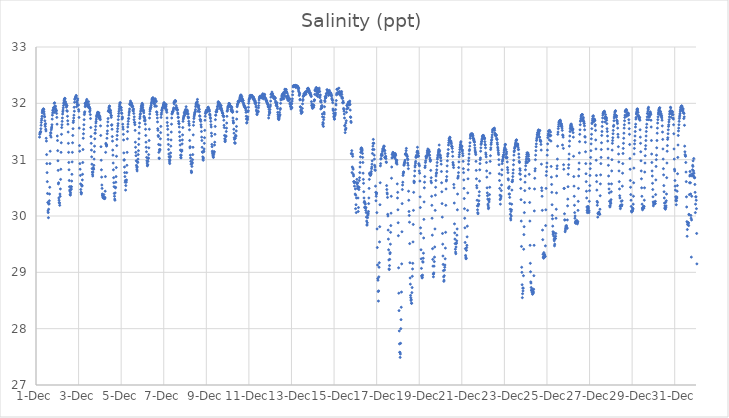
| Category | Salinity (ppt) |
|---|---|
| 44896.166666666664 | 31.4 |
| 44896.177083333336 | 31.45 |
| 44896.1875 | 31.47 |
| 44896.197916666664 | 31.48 |
| 44896.208333333336 | 31.49 |
| 44896.21875 | 31.5 |
| 44896.229166666664 | 31.55 |
| 44896.239583333336 | 31.61 |
| 44896.25 | 31.66 |
| 44896.260416666664 | 31.7 |
| 44896.270833333336 | 31.73 |
| 44896.28125 | 31.77 |
| 44896.291666666664 | 31.83 |
| 44896.302083333336 | 31.86 |
| 44896.3125 | 31.87 |
| 44896.322916666664 | 31.89 |
| 44896.333333333336 | 31.89 |
| 44896.34375 | 31.9 |
| 44896.354166666664 | 31.9 |
| 44896.364583333336 | 31.89 |
| 44896.375 | 31.85 |
| 44896.385416666664 | 31.81 |
| 44896.395833333336 | 31.77 |
| 44896.40625 | 31.76 |
| 44896.416666666664 | 31.69 |
| 44896.427083333336 | 31.62 |
| 44896.4375 | 31.59 |
| 44896.447916666664 | 31.64 |
| 44896.458333333336 | 31.54 |
| 44896.46875 | 31.51 |
| 44896.479166666664 | 31.38 |
| 44896.489583333336 | 31.33 |
| 44896.5 | 31.09 |
| 44896.510416666664 | 30.93 |
| 44896.520833333336 | 30.77 |
| 44896.53125 | 30.61 |
| 44896.541666666664 | 30.4 |
| 44896.552083333336 | 30.24 |
| 44896.5625 | 30.09 |
| 44896.572916666664 | 30.06 |
| 44896.583333333336 | 29.97 |
| 44896.59375 | 30.12 |
| 44896.604166666664 | 30.21 |
| 44896.614583333336 | 30.22 |
| 44896.625 | 30.27 |
| 44896.635416666664 | 30.39 |
| 44896.645833333336 | 30.51 |
| 44896.65625 | 30.93 |
| 44896.666666666664 | 31.15 |
| 44896.677083333336 | 31.43 |
| 44896.6875 | 31.48 |
| 44896.697916666664 | 31.47 |
| 44896.708333333336 | 31.4 |
| 44896.71875 | 31.53 |
| 44896.729166666664 | 31.56 |
| 44896.739583333336 | 31.58 |
| 44896.75 | 31.62 |
| 44896.760416666664 | 31.72 |
| 44896.770833333336 | 31.79 |
| 44896.78125 | 31.83 |
| 44896.791666666664 | 31.87 |
| 44896.802083333336 | 31.88 |
| 44896.8125 | 31.89 |
| 44896.822916666664 | 31.92 |
| 44896.833333333336 | 31.92 |
| 44896.84375 | 31.93 |
| 44896.854166666664 | 32 |
| 44896.864583333336 | 31.84 |
| 44896.875 | 32.01 |
| 44896.885416666664 | 31.95 |
| 44896.895833333336 | 31.93 |
| 44896.90625 | 31.89 |
| 44896.916666666664 | 31.95 |
| 44896.927083333336 | 31.9 |
| 44896.9375 | 31.86 |
| 44896.947916666664 | 31.88 |
| 44896.958333333336 | 31.87 |
| 44896.96875 | 31.82 |
| 44896.979166666664 | 31.75 |
| 44896.989583333336 | 31.63 |
| 44897.0 | 31.42 |
| 44897.010416666664 | 31.34 |
| 44897.020833333336 | 31.16 |
| 44897.03125 | 30.98 |
| 44897.041666666664 | 30.81 |
| 44897.052083333336 | 30.57 |
| 44897.0625 | 30.59 |
| 44897.072916666664 | 30.32 |
| 44897.083333333336 | 30.28 |
| 44897.09375 | 30.24 |
| 44897.104166666664 | 30.23 |
| 44897.114583333336 | 30.19 |
| 44897.125 | 30.39 |
| 44897.135416666664 | 30.35 |
| 44897.145833333336 | 30.48 |
| 44897.15625 | 30.65 |
| 44897.166666666664 | 30.83 |
| 44897.177083333336 | 31.13 |
| 44897.1875 | 31.3 |
| 44897.197916666664 | 31.45 |
| 44897.208333333336 | 31.57 |
| 44897.21875 | 31.62 |
| 44897.229166666664 | 31.68 |
| 44897.239583333336 | 31.74 |
| 44897.25 | 31.81 |
| 44897.260416666664 | 31.85 |
| 44897.270833333336 | 31.88 |
| 44897.28125 | 31.92 |
| 44897.291666666664 | 31.96 |
| 44897.302083333336 | 32 |
| 44897.3125 | 32.02 |
| 44897.322916666664 | 32.05 |
| 44897.333333333336 | 32.07 |
| 44897.34375 | 32.08 |
| 44897.354166666664 | 32.09 |
| 44897.364583333336 | 32.08 |
| 44897.375 | 31.99 |
| 44897.385416666664 | 32.03 |
| 44897.395833333336 | 32 |
| 44897.40625 | 31.98 |
| 44897.416666666664 | 31.99 |
| 44897.427083333336 | 31.93 |
| 44897.4375 | 31.95 |
| 44897.447916666664 | 31.87 |
| 44897.458333333336 | 31.96 |
| 44897.46875 | 31.86 |
| 44897.479166666664 | 31.77 |
| 44897.489583333336 | 31.69 |
| 44897.5 | 31.63 |
| 44897.510416666664 | 31.49 |
| 44897.520833333336 | 31.29 |
| 44897.53125 | 31.13 |
| 44897.541666666664 | 30.95 |
| 44897.552083333336 | 30.82 |
| 44897.5625 | 30.63 |
| 44897.572916666664 | 30.52 |
| 44897.583333333336 | 30.46 |
| 44897.59375 | 30.44 |
| 44897.604166666664 | 30.38 |
| 44897.614583333336 | 30.37 |
| 44897.625 | 30.41 |
| 44897.635416666664 | 30.52 |
| 44897.645833333336 | 30.47 |
| 44897.65625 | 30.48 |
| 44897.666666666664 | 30.52 |
| 44897.677083333336 | 30.62 |
| 44897.6875 | 30.74 |
| 44897.697916666664 | 30.96 |
| 44897.708333333336 | 31.13 |
| 44897.71875 | 31.3 |
| 44897.729166666664 | 31.43 |
| 44897.739583333336 | 31.55 |
| 44897.75 | 31.66 |
| 44897.760416666664 | 31.69 |
| 44897.770833333336 | 31.74 |
| 44897.78125 | 31.79 |
| 44897.791666666664 | 31.93 |
| 44897.802083333336 | 31.86 |
| 44897.8125 | 32.02 |
| 44897.822916666664 | 32.07 |
| 44897.833333333336 | 32.08 |
| 44897.84375 | 32.09 |
| 44897.854166666664 | 32.11 |
| 44897.864583333336 | 32.11 |
| 44897.875 | 32.11 |
| 44897.885416666664 | 32.14 |
| 44897.895833333336 | 32.13 |
| 44897.90625 | 31.94 |
| 44897.916666666664 | 32.02 |
| 44897.927083333336 | 32.02 |
| 44897.9375 | 31.98 |
| 44897.947916666664 | 32.05 |
| 44897.958333333336 | 32.08 |
| 44897.96875 | 31.97 |
| 44897.979166666664 | 31.97 |
| 44897.989583333336 | 31.97 |
| 44898.0 | 31.89 |
| 44898.010416666664 | 31.86 |
| 44898.020833333336 | 31.75 |
| 44898.03125 | 31.56 |
| 44898.041666666664 | 31.25 |
| 44898.052083333336 | 31.15 |
| 44898.0625 | 30.93 |
| 44898.072916666664 | 30.83 |
| 44898.083333333336 | 30.72 |
| 44898.09375 | 30.57 |
| 44898.104166666664 | 30.47 |
| 44898.114583333336 | 30.42 |
| 44898.125 | 30.39 |
| 44898.135416666664 | 30.41 |
| 44898.145833333336 | 30.55 |
| 44898.15625 | 30.53 |
| 44898.166666666664 | 30.54 |
| 44898.177083333336 | 30.64 |
| 44898.1875 | 30.74 |
| 44898.197916666664 | 30.95 |
| 44898.208333333336 | 31.18 |
| 44898.21875 | 31.38 |
| 44898.229166666664 | 31.46 |
| 44898.239583333336 | 31.54 |
| 44898.25 | 31.62 |
| 44898.260416666664 | 31.71 |
| 44898.270833333336 | 31.8 |
| 44898.28125 | 31.83 |
| 44898.291666666664 | 31.85 |
| 44898.302083333336 | 32 |
| 44898.3125 | 31.94 |
| 44898.322916666664 | 31.96 |
| 44898.333333333336 | 31.98 |
| 44898.34375 | 32 |
| 44898.354166666664 | 32.02 |
| 44898.364583333336 | 32.04 |
| 44898.375 | 32.01 |
| 44898.385416666664 | 32.07 |
| 44898.395833333336 | 32.03 |
| 44898.40625 | 32.01 |
| 44898.416666666664 | 31.95 |
| 44898.427083333336 | 31.97 |
| 44898.4375 | 31.94 |
| 44898.447916666664 | 31.96 |
| 44898.458333333336 | 31.97 |
| 44898.46875 | 32.03 |
| 44898.479166666664 | 31.98 |
| 44898.489583333336 | 31.92 |
| 44898.5 | 31.94 |
| 44898.510416666664 | 31.92 |
| 44898.520833333336 | 31.85 |
| 44898.53125 | 31.91 |
| 44898.541666666664 | 31.88 |
| 44898.552083333336 | 31.8 |
| 44898.5625 | 31.73 |
| 44898.572916666664 | 31.57 |
| 44898.583333333336 | 31.41 |
| 44898.59375 | 31.29 |
| 44898.604166666664 | 31.17 |
| 44898.614583333336 | 31.05 |
| 44898.625 | 30.92 |
| 44898.635416666664 | 30.84 |
| 44898.645833333336 | 30.78 |
| 44898.65625 | 30.74 |
| 44898.666666666664 | 30.71 |
| 44898.677083333336 | 30.78 |
| 44898.6875 | 30.86 |
| 44898.697916666664 | 30.84 |
| 44898.708333333336 | 30.83 |
| 44898.71875 | 30.9 |
| 44898.729166666664 | 31.01 |
| 44898.739583333336 | 31.14 |
| 44898.75 | 31.24 |
| 44898.760416666664 | 31.37 |
| 44898.770833333336 | 31.47 |
| 44898.78125 | 31.47 |
| 44898.791666666664 | 31.53 |
| 44898.802083333336 | 31.59 |
| 44898.8125 | 31.65 |
| 44898.822916666664 | 31.68 |
| 44898.833333333336 | 31.72 |
| 44898.84375 | 31.76 |
| 44898.854166666664 | 31.78 |
| 44898.864583333336 | 31.79 |
| 44898.875 | 31.8 |
| 44898.885416666664 | 31.82 |
| 44898.895833333336 | 31.84 |
| 44898.90625 | 31.84 |
| 44898.916666666664 | 31.84 |
| 44898.927083333336 | 31.81 |
| 44898.9375 | 31.79 |
| 44898.947916666664 | 31.75 |
| 44898.958333333336 | 31.83 |
| 44898.96875 | 31.79 |
| 44898.979166666664 | 31.73 |
| 44898.989583333336 | 31.73 |
| 44899.0 | 31.77 |
| 44899.010416666664 | 31.74 |
| 44899.020833333336 | 31.71 |
| 44899.03125 | 31.6 |
| 44899.041666666664 | 31.43 |
| 44899.052083333336 | 31.23 |
| 44899.0625 | 30.99 |
| 44899.072916666664 | 30.82 |
| 44899.083333333336 | 30.69 |
| 44899.09375 | 30.55 |
| 44899.104166666664 | 30.49 |
| 44899.114583333336 | 30.39 |
| 44899.125 | 30.36 |
| 44899.135416666664 | 30.36 |
| 44899.145833333336 | 30.33 |
| 44899.15625 | 30.32 |
| 44899.166666666664 | 30.33 |
| 44899.177083333336 | 30.33 |
| 44899.1875 | 30.38 |
| 44899.197916666664 | 30.32 |
| 44899.208333333336 | 30.31 |
| 44899.21875 | 30.31 |
| 44899.229166666664 | 30.31 |
| 44899.239583333336 | 30.33 |
| 44899.25 | 30.44 |
| 44899.260416666664 | 30.7 |
| 44899.270833333336 | 31.13 |
| 44899.28125 | 31.29 |
| 44899.291666666664 | 31.27 |
| 44899.302083333336 | 31.26 |
| 44899.3125 | 31.24 |
| 44899.322916666664 | 31.26 |
| 44899.333333333336 | 31.38 |
| 44899.34375 | 31.46 |
| 44899.354166666664 | 31.51 |
| 44899.364583333336 | 31.6 |
| 44899.375 | 31.67 |
| 44899.385416666664 | 31.73 |
| 44899.395833333336 | 31.86 |
| 44899.40625 | 31.86 |
| 44899.416666666664 | 31.88 |
| 44899.427083333336 | 31.93 |
| 44899.4375 | 31.91 |
| 44899.447916666664 | 31.95 |
| 44899.458333333336 | 31.95 |
| 44899.46875 | 31.84 |
| 44899.479166666664 | 31.86 |
| 44899.489583333336 | 31.88 |
| 44899.5 | 31.87 |
| 44899.510416666664 | 31.83 |
| 44899.520833333336 | 31.79 |
| 44899.53125 | 31.75 |
| 44899.541666666664 | 31.78 |
| 44899.552083333336 | 31.61 |
| 44899.5625 | 31.62 |
| 44899.572916666664 | 31.54 |
| 44899.583333333336 | 31.41 |
| 44899.59375 | 31.33 |
| 44899.604166666664 | 31.17 |
| 44899.614583333336 | 31.08 |
| 44899.625 | 30.94 |
| 44899.635416666664 | 30.82 |
| 44899.645833333336 | 30.68 |
| 44899.65625 | 30.59 |
| 44899.666666666664 | 30.52 |
| 44899.677083333336 | 30.4 |
| 44899.6875 | 30.35 |
| 44899.697916666664 | 30.3 |
| 44899.708333333336 | 30.28 |
| 44899.71875 | 30.41 |
| 44899.729166666664 | 30.5 |
| 44899.739583333336 | 30.51 |
| 44899.75 | 30.6 |
| 44899.760416666664 | 30.7 |
| 44899.770833333336 | 30.86 |
| 44899.78125 | 31.06 |
| 44899.791666666664 | 31.25 |
| 44899.802083333336 | 31.36 |
| 44899.8125 | 31.43 |
| 44899.822916666664 | 31.5 |
| 44899.833333333336 | 31.55 |
| 44899.84375 | 31.6 |
| 44899.854166666664 | 31.64 |
| 44899.864583333336 | 31.71 |
| 44899.875 | 31.77 |
| 44899.885416666664 | 31.82 |
| 44899.895833333336 | 31.86 |
| 44899.90625 | 31.9 |
| 44899.916666666664 | 31.94 |
| 44899.927083333336 | 31.97 |
| 44899.9375 | 31.99 |
| 44899.947916666664 | 32.01 |
| 44899.958333333336 | 32.01 |
| 44899.96875 | 31.93 |
| 44899.979166666664 | 31.93 |
| 44899.989583333336 | 31.93 |
| 44900.0 | 31.92 |
| 44900.010416666664 | 31.88 |
| 44900.020833333336 | 31.83 |
| 44900.03125 | 31.82 |
| 44900.041666666664 | 31.72 |
| 44900.052083333336 | 31.76 |
| 44900.0625 | 31.74 |
| 44900.072916666664 | 31.63 |
| 44900.083333333336 | 31.58 |
| 44900.09375 | 31.54 |
| 44900.104166666664 | 31.45 |
| 44900.114583333336 | 31.35 |
| 44900.125 | 31.12 |
| 44900.135416666664 | 30.99 |
| 44900.145833333336 | 31 |
| 44900.15625 | 30.87 |
| 44900.166666666664 | 30.77 |
| 44900.177083333336 | 30.7 |
| 44900.1875 | 30.6 |
| 44900.197916666664 | 30.63 |
| 44900.208333333336 | 30.46 |
| 44900.21875 | 30.54 |
| 44900.229166666664 | 30.62 |
| 44900.239583333336 | 30.6 |
| 44900.25 | 30.64 |
| 44900.260416666664 | 30.77 |
| 44900.270833333336 | 30.9 |
| 44900.28125 | 31.13 |
| 44900.291666666664 | 31.37 |
| 44900.302083333336 | 31.5 |
| 44900.3125 | 31.58 |
| 44900.322916666664 | 31.63 |
| 44900.333333333336 | 31.68 |
| 44900.34375 | 31.73 |
| 44900.354166666664 | 31.73 |
| 44900.364583333336 | 31.79 |
| 44900.375 | 31.83 |
| 44900.385416666664 | 31.86 |
| 44900.395833333336 | 31.9 |
| 44900.40625 | 31.98 |
| 44900.416666666664 | 32 |
| 44900.427083333336 | 31.98 |
| 44900.4375 | 32.04 |
| 44900.447916666664 | 31.99 |
| 44900.458333333336 | 31.99 |
| 44900.46875 | 32 |
| 44900.479166666664 | 32.01 |
| 44900.489583333336 | 31.99 |
| 44900.5 | 31.94 |
| 44900.510416666664 | 31.97 |
| 44900.520833333336 | 31.95 |
| 44900.53125 | 31.95 |
| 44900.541666666664 | 31.94 |
| 44900.552083333336 | 31.88 |
| 44900.5625 | 31.88 |
| 44900.572916666664 | 31.86 |
| 44900.583333333336 | 31.9 |
| 44900.59375 | 31.82 |
| 44900.604166666664 | 31.71 |
| 44900.614583333336 | 31.76 |
| 44900.625 | 31.66 |
| 44900.635416666664 | 31.66 |
| 44900.645833333336 | 31.62 |
| 44900.65625 | 31.52 |
| 44900.666666666664 | 31.31 |
| 44900.677083333336 | 31.22 |
| 44900.6875 | 31.13 |
| 44900.697916666664 | 31.07 |
| 44900.708333333336 | 30.98 |
| 44900.71875 | 30.9 |
| 44900.729166666664 | 30.87 |
| 44900.739583333336 | 30.83 |
| 44900.75 | 30.8 |
| 44900.760416666664 | 30.87 |
| 44900.770833333336 | 30.96 |
| 44900.78125 | 30.95 |
| 44900.791666666664 | 31.01 |
| 44900.802083333336 | 31.09 |
| 44900.8125 | 31.16 |
| 44900.822916666664 | 31.27 |
| 44900.833333333336 | 31.37 |
| 44900.84375 | 31.47 |
| 44900.854166666664 | 31.58 |
| 44900.864583333336 | 31.65 |
| 44900.875 | 31.73 |
| 44900.885416666664 | 31.76 |
| 44900.895833333336 | 31.8 |
| 44900.90625 | 31.82 |
| 44900.916666666664 | 31.86 |
| 44900.927083333336 | 31.88 |
| 44900.9375 | 31.91 |
| 44900.947916666664 | 31.94 |
| 44900.958333333336 | 31.96 |
| 44900.96875 | 31.97 |
| 44900.979166666664 | 31.99 |
| 44900.989583333336 | 32 |
| 44901.0 | 31.93 |
| 44901.010416666664 | 31.93 |
| 44901.020833333336 | 31.97 |
| 44901.03125 | 31.89 |
| 44901.041666666664 | 31.86 |
| 44901.052083333336 | 31.87 |
| 44901.0625 | 31.83 |
| 44901.072916666664 | 31.77 |
| 44901.083333333336 | 31.75 |
| 44901.09375 | 31.69 |
| 44901.104166666664 | 31.74 |
| 44901.114583333336 | 31.71 |
| 44901.125 | 31.69 |
| 44901.135416666664 | 31.63 |
| 44901.145833333336 | 31.54 |
| 44901.15625 | 31.43 |
| 44901.166666666664 | 31.31 |
| 44901.177083333336 | 31.22 |
| 44901.1875 | 31.14 |
| 44901.197916666664 | 31.04 |
| 44901.208333333336 | 30.98 |
| 44901.21875 | 30.94 |
| 44901.229166666664 | 30.89 |
| 44901.239583333336 | 30.9 |
| 44901.25 | 30.91 |
| 44901.260416666664 | 30.97 |
| 44901.270833333336 | 31.02 |
| 44901.28125 | 31.03 |
| 44901.291666666664 | 31.09 |
| 44901.302083333336 | 31.21 |
| 44901.3125 | 31.34 |
| 44901.322916666664 | 31.54 |
| 44901.333333333336 | 31.74 |
| 44901.34375 | 31.81 |
| 44901.354166666664 | 31.86 |
| 44901.364583333336 | 31.89 |
| 44901.375 | 31.91 |
| 44901.385416666664 | 31.93 |
| 44901.395833333336 | 31.93 |
| 44901.40625 | 31.96 |
| 44901.416666666664 | 31.99 |
| 44901.427083333336 | 32.01 |
| 44901.4375 | 32.04 |
| 44901.447916666664 | 32.07 |
| 44901.458333333336 | 32.08 |
| 44901.46875 | 32.09 |
| 44901.479166666664 | 32.08 |
| 44901.489583333336 | 32.1 |
| 44901.5 | 32.09 |
| 44901.510416666664 | 32.09 |
| 44901.520833333336 | 32.07 |
| 44901.53125 | 32 |
| 44901.541666666664 | 32.03 |
| 44901.552083333336 | 32.04 |
| 44901.5625 | 32 |
| 44901.572916666664 | 31.99 |
| 44901.583333333336 | 31.95 |
| 44901.59375 | 31.95 |
| 44901.604166666664 | 32.08 |
| 44901.614583333336 | 32.05 |
| 44901.625 | 32.05 |
| 44901.635416666664 | 32.04 |
| 44901.645833333336 | 32.03 |
| 44901.65625 | 31.95 |
| 44901.666666666664 | 31.85 |
| 44901.677083333336 | 31.84 |
| 44901.6875 | 31.8 |
| 44901.697916666664 | 31.74 |
| 44901.708333333336 | 31.67 |
| 44901.71875 | 31.55 |
| 44901.729166666664 | 31.52 |
| 44901.739583333336 | 31.43 |
| 44901.75 | 31.41 |
| 44901.760416666664 | 31.27 |
| 44901.770833333336 | 31.13 |
| 44901.78125 | 31.03 |
| 44901.791666666664 | 31.02 |
| 44901.802083333336 | 31.18 |
| 44901.8125 | 31.16 |
| 44901.822916666664 | 31.18 |
| 44901.833333333336 | 31.26 |
| 44901.84375 | 31.37 |
| 44901.854166666664 | 31.48 |
| 44901.864583333336 | 31.59 |
| 44901.875 | 31.75 |
| 44901.885416666664 | 31.8 |
| 44901.895833333336 | 31.83 |
| 44901.90625 | 31.88 |
| 44901.916666666664 | 31.87 |
| 44901.927083333336 | 31.9 |
| 44901.9375 | 31.92 |
| 44901.947916666664 | 31.92 |
| 44901.958333333336 | 31.93 |
| 44901.96875 | 31.95 |
| 44901.979166666664 | 31.97 |
| 44901.989583333336 | 31.98 |
| 44902.0 | 31.99 |
| 44902.010416666664 | 32.01 |
| 44902.020833333336 | 32.01 |
| 44902.03125 | 31.99 |
| 44902.041666666664 | 31.95 |
| 44902.052083333336 | 31.93 |
| 44902.0625 | 31.91 |
| 44902.072916666664 | 31.92 |
| 44902.083333333336 | 31.97 |
| 44902.09375 | 31.96 |
| 44902.104166666664 | 31.94 |
| 44902.114583333336 | 31.98 |
| 44902.125 | 31.87 |
| 44902.135416666664 | 31.89 |
| 44902.145833333336 | 31.84 |
| 44902.15625 | 31.74 |
| 44902.166666666664 | 31.66 |
| 44902.177083333336 | 31.6 |
| 44902.1875 | 31.54 |
| 44902.197916666664 | 31.44 |
| 44902.208333333336 | 31.36 |
| 44902.21875 | 31.27 |
| 44902.229166666664 | 31.18 |
| 44902.239583333336 | 31.1 |
| 44902.25 | 31.05 |
| 44902.260416666664 | 31 |
| 44902.270833333336 | 30.96 |
| 44902.28125 | 30.93 |
| 44902.291666666664 | 30.99 |
| 44902.302083333336 | 31.04 |
| 44902.3125 | 31.06 |
| 44902.322916666664 | 31.12 |
| 44902.333333333336 | 31.24 |
| 44902.34375 | 31.35 |
| 44902.354166666664 | 31.49 |
| 44902.364583333336 | 31.63 |
| 44902.375 | 31.74 |
| 44902.385416666664 | 31.81 |
| 44902.395833333336 | 31.82 |
| 44902.40625 | 31.85 |
| 44902.416666666664 | 31.85 |
| 44902.427083333336 | 31.85 |
| 44902.4375 | 31.86 |
| 44902.447916666664 | 31.88 |
| 44902.458333333336 | 31.9 |
| 44902.46875 | 31.92 |
| 44902.479166666664 | 32.01 |
| 44902.489583333336 | 31.99 |
| 44902.5 | 32.03 |
| 44902.510416666664 | 32.02 |
| 44902.520833333336 | 32.04 |
| 44902.53125 | 32.03 |
| 44902.541666666664 | 32.05 |
| 44902.552083333336 | 32.03 |
| 44902.5625 | 32.04 |
| 44902.572916666664 | 31.91 |
| 44902.583333333336 | 31.96 |
| 44902.59375 | 31.93 |
| 44902.604166666664 | 31.89 |
| 44902.614583333336 | 31.92 |
| 44902.625 | 31.88 |
| 44902.635416666664 | 31.88 |
| 44902.645833333336 | 31.89 |
| 44902.65625 | 31.83 |
| 44902.666666666664 | 31.81 |
| 44902.677083333336 | 31.75 |
| 44902.6875 | 31.75 |
| 44902.697916666664 | 31.68 |
| 44902.708333333336 | 31.64 |
| 44902.71875 | 31.64 |
| 44902.729166666664 | 31.58 |
| 44902.739583333336 | 31.49 |
| 44902.75 | 31.41 |
| 44902.760416666664 | 31.34 |
| 44902.770833333336 | 31.26 |
| 44902.78125 | 31.17 |
| 44902.791666666664 | 31.08 |
| 44902.802083333336 | 31.04 |
| 44902.8125 | 31.03 |
| 44902.822916666664 | 31.08 |
| 44902.833333333336 | 31.15 |
| 44902.84375 | 31.15 |
| 44902.854166666664 | 31.17 |
| 44902.864583333336 | 31.28 |
| 44902.875 | 31.35 |
| 44902.885416666664 | 31.44 |
| 44902.895833333336 | 31.57 |
| 44902.90625 | 31.68 |
| 44902.916666666664 | 31.72 |
| 44902.927083333336 | 31.74 |
| 44902.9375 | 31.76 |
| 44902.947916666664 | 31.78 |
| 44902.958333333336 | 31.83 |
| 44902.96875 | 31.78 |
| 44902.979166666664 | 31.79 |
| 44902.989583333336 | 31.86 |
| 44903.0 | 31.82 |
| 44903.010416666664 | 31.85 |
| 44903.020833333336 | 31.89 |
| 44903.03125 | 31.86 |
| 44903.041666666664 | 31.86 |
| 44903.052083333336 | 31.94 |
| 44903.0625 | 31.88 |
| 44903.072916666664 | 31.82 |
| 44903.083333333336 | 31.88 |
| 44903.09375 | 31.83 |
| 44903.104166666664 | 31.88 |
| 44903.114583333336 | 31.86 |
| 44903.125 | 31.82 |
| 44903.135416666664 | 31.76 |
| 44903.145833333336 | 31.81 |
| 44903.15625 | 31.74 |
| 44903.166666666664 | 31.75 |
| 44903.177083333336 | 31.68 |
| 44903.1875 | 31.64 |
| 44903.197916666664 | 31.61 |
| 44903.208333333336 | 31.53 |
| 44903.21875 | 31.34 |
| 44903.229166666664 | 31.21 |
| 44903.239583333336 | 31.23 |
| 44903.25 | 31.08 |
| 44903.260416666664 | 31.03 |
| 44903.270833333336 | 30.97 |
| 44903.28125 | 30.92 |
| 44903.291666666664 | 30.8 |
| 44903.302083333336 | 30.77 |
| 44903.3125 | 30.78 |
| 44903.322916666664 | 30.88 |
| 44903.333333333336 | 30.93 |
| 44903.34375 | 30.95 |
| 44903.354166666664 | 31 |
| 44903.364583333336 | 31.09 |
| 44903.375 | 31.22 |
| 44903.385416666664 | 31.44 |
| 44903.395833333336 | 31.61 |
| 44903.40625 | 31.67 |
| 44903.416666666664 | 31.73 |
| 44903.427083333336 | 31.76 |
| 44903.4375 | 31.79 |
| 44903.447916666664 | 31.81 |
| 44903.458333333336 | 31.83 |
| 44903.46875 | 31.84 |
| 44903.479166666664 | 31.86 |
| 44903.489583333336 | 31.89 |
| 44903.5 | 31.94 |
| 44903.510416666664 | 31.97 |
| 44903.520833333336 | 31.99 |
| 44903.53125 | 32 |
| 44903.541666666664 | 32.01 |
| 44903.552083333336 | 32.01 |
| 44903.5625 | 32.02 |
| 44903.572916666664 | 32.03 |
| 44903.583333333336 | 32.07 |
| 44903.59375 | 31.98 |
| 44903.604166666664 | 31.86 |
| 44903.614583333336 | 31.94 |
| 44903.625 | 31.94 |
| 44903.635416666664 | 31.92 |
| 44903.645833333336 | 31.96 |
| 44903.65625 | 31.9 |
| 44903.666666666664 | 31.89 |
| 44903.677083333336 | 31.85 |
| 44903.6875 | 31.78 |
| 44903.697916666664 | 31.77 |
| 44903.708333333336 | 31.71 |
| 44903.71875 | 31.71 |
| 44903.729166666664 | 31.71 |
| 44903.739583333336 | 31.68 |
| 44903.75 | 31.62 |
| 44903.760416666664 | 31.58 |
| 44903.770833333336 | 31.5 |
| 44903.78125 | 31.4 |
| 44903.791666666664 | 31.34 |
| 44903.802083333336 | 31.22 |
| 44903.8125 | 31.14 |
| 44903.822916666664 | 31.13 |
| 44903.833333333336 | 31.05 |
| 44903.84375 | 31.01 |
| 44903.854166666664 | 30.99 |
| 44903.864583333336 | 31.03 |
| 44903.875 | 31.14 |
| 44903.885416666664 | 31.15 |
| 44903.895833333336 | 31.19 |
| 44903.90625 | 31.29 |
| 44903.916666666664 | 31.39 |
| 44903.927083333336 | 31.52 |
| 44903.9375 | 31.7 |
| 44903.947916666664 | 31.77 |
| 44903.958333333336 | 31.82 |
| 44903.96875 | 31.83 |
| 44903.979166666664 | 31.85 |
| 44903.989583333336 | 31.86 |
| 44904.0 | 31.87 |
| 44904.010416666664 | 31.88 |
| 44904.020833333336 | 31.88 |
| 44904.03125 | 31.86 |
| 44904.041666666664 | 31.86 |
| 44904.052083333336 | 31.85 |
| 44904.0625 | 31.87 |
| 44904.072916666664 | 31.92 |
| 44904.083333333336 | 31.93 |
| 44904.09375 | 31.93 |
| 44904.104166666664 | 31.89 |
| 44904.114583333336 | 31.9 |
| 44904.125 | 31.89 |
| 44904.135416666664 | 31.88 |
| 44904.145833333336 | 31.86 |
| 44904.15625 | 31.8 |
| 44904.166666666664 | 31.81 |
| 44904.177083333336 | 31.79 |
| 44904.1875 | 31.75 |
| 44904.197916666664 | 31.73 |
| 44904.208333333336 | 31.68 |
| 44904.21875 | 31.62 |
| 44904.229166666664 | 31.58 |
| 44904.239583333336 | 31.47 |
| 44904.25 | 31.42 |
| 44904.260416666664 | 31.27 |
| 44904.270833333336 | 31.23 |
| 44904.28125 | 31.15 |
| 44904.291666666664 | 31.12 |
| 44904.302083333336 | 31.1 |
| 44904.3125 | 31.07 |
| 44904.322916666664 | 31.05 |
| 44904.333333333336 | 31.04 |
| 44904.34375 | 31.09 |
| 44904.354166666664 | 31.14 |
| 44904.364583333336 | 31.12 |
| 44904.375 | 31.14 |
| 44904.385416666664 | 31.26 |
| 44904.395833333336 | 31.31 |
| 44904.40625 | 31.45 |
| 44904.416666666664 | 31.59 |
| 44904.427083333336 | 31.71 |
| 44904.4375 | 31.79 |
| 44904.447916666664 | 31.79 |
| 44904.458333333336 | 31.85 |
| 44904.46875 | 31.85 |
| 44904.479166666664 | 31.86 |
| 44904.489583333336 | 31.85 |
| 44904.5 | 31.89 |
| 44904.510416666664 | 31.89 |
| 44904.520833333336 | 31.94 |
| 44904.53125 | 31.94 |
| 44904.541666666664 | 31.97 |
| 44904.552083333336 | 32.01 |
| 44904.5625 | 32.03 |
| 44904.572916666664 | 32.01 |
| 44904.583333333336 | 32 |
| 44904.59375 | 32 |
| 44904.604166666664 | 32.01 |
| 44904.614583333336 | 31.97 |
| 44904.625 | 31.91 |
| 44904.635416666664 | 31.99 |
| 44904.645833333336 | 31.97 |
| 44904.65625 | 31.95 |
| 44904.666666666664 | 31.94 |
| 44904.677083333336 | 31.92 |
| 44904.6875 | 31.92 |
| 44904.697916666664 | 31.96 |
| 44904.708333333336 | 31.88 |
| 44904.71875 | 31.9 |
| 44904.729166666664 | 31.87 |
| 44904.739583333336 | 31.86 |
| 44904.75 | 31.83 |
| 44904.760416666664 | 31.83 |
| 44904.770833333336 | 31.82 |
| 44904.78125 | 31.78 |
| 44904.791666666664 | 31.78 |
| 44904.802083333336 | 31.78 |
| 44904.8125 | 31.76 |
| 44904.822916666664 | 31.7 |
| 44904.833333333336 | 31.61 |
| 44904.84375 | 31.57 |
| 44904.854166666664 | 31.43 |
| 44904.864583333336 | 31.37 |
| 44904.875 | 31.33 |
| 44904.885416666664 | 31.32 |
| 44904.895833333336 | 31.35 |
| 44904.90625 | 31.42 |
| 44904.916666666664 | 31.41 |
| 44904.927083333336 | 31.42 |
| 44904.9375 | 31.5 |
| 44904.947916666664 | 31.56 |
| 44904.958333333336 | 31.65 |
| 44904.96875 | 31.77 |
| 44904.979166666664 | 31.86 |
| 44904.989583333336 | 31.87 |
| 44905.0 | 31.9 |
| 44905.010416666664 | 31.93 |
| 44905.020833333336 | 31.95 |
| 44905.03125 | 31.94 |
| 44905.041666666664 | 31.95 |
| 44905.052083333336 | 31.97 |
| 44905.0625 | 32 |
| 44905.072916666664 | 31.99 |
| 44905.083333333336 | 31.99 |
| 44905.09375 | 31.96 |
| 44905.104166666664 | 31.99 |
| 44905.114583333336 | 31.94 |
| 44905.125 | 31.95 |
| 44905.135416666664 | 31.95 |
| 44905.145833333336 | 31.95 |
| 44905.15625 | 31.89 |
| 44905.166666666664 | 31.93 |
| 44905.177083333336 | 31.86 |
| 44905.1875 | 31.94 |
| 44905.197916666664 | 31.92 |
| 44905.208333333336 | 31.87 |
| 44905.21875 | 31.88 |
| 44905.229166666664 | 31.84 |
| 44905.239583333336 | 31.85 |
| 44905.25 | 31.74 |
| 44905.260416666664 | 31.69 |
| 44905.270833333336 | 31.65 |
| 44905.28125 | 31.66 |
| 44905.291666666664 | 31.54 |
| 44905.302083333336 | 31.47 |
| 44905.3125 | 31.39 |
| 44905.322916666664 | 31.36 |
| 44905.333333333336 | 31.3 |
| 44905.34375 | 31.3 |
| 44905.354166666664 | 31.29 |
| 44905.364583333336 | 31.38 |
| 44905.375 | 31.43 |
| 44905.385416666664 | 31.42 |
| 44905.395833333336 | 31.42 |
| 44905.40625 | 31.51 |
| 44905.416666666664 | 31.59 |
| 44905.427083333336 | 31.72 |
| 44905.4375 | 31.85 |
| 44905.447916666664 | 31.94 |
| 44905.458333333336 | 31.97 |
| 44905.46875 | 31.98 |
| 44905.479166666664 | 32 |
| 44905.489583333336 | 32.03 |
| 44905.5 | 32.04 |
| 44905.510416666664 | 32.02 |
| 44905.520833333336 | 32.03 |
| 44905.53125 | 32.03 |
| 44905.541666666664 | 32.04 |
| 44905.552083333336 | 32.04 |
| 44905.5625 | 32.06 |
| 44905.572916666664 | 32.09 |
| 44905.583333333336 | 32.1 |
| 44905.59375 | 32.12 |
| 44905.604166666664 | 32.14 |
| 44905.614583333336 | 32.13 |
| 44905.625 | 32.15 |
| 44905.635416666664 | 32.14 |
| 44905.645833333336 | 32.07 |
| 44905.65625 | 32.04 |
| 44905.666666666664 | 32.12 |
| 44905.677083333336 | 32.09 |
| 44905.6875 | 32.08 |
| 44905.697916666664 | 32.06 |
| 44905.708333333336 | 32.05 |
| 44905.71875 | 32.05 |
| 44905.729166666664 | 32.05 |
| 44905.739583333336 | 32.01 |
| 44905.75 | 31.99 |
| 44905.760416666664 | 31.97 |
| 44905.770833333336 | 31.97 |
| 44905.78125 | 31.95 |
| 44905.791666666664 | 31.94 |
| 44905.802083333336 | 31.95 |
| 44905.8125 | 31.93 |
| 44905.822916666664 | 31.92 |
| 44905.833333333336 | 31.93 |
| 44905.84375 | 31.91 |
| 44905.854166666664 | 31.88 |
| 44905.864583333336 | 31.84 |
| 44905.875 | 31.77 |
| 44905.885416666664 | 31.72 |
| 44905.895833333336 | 31.65 |
| 44905.90625 | 31.66 |
| 44905.916666666664 | 31.73 |
| 44905.927083333336 | 31.73 |
| 44905.9375 | 31.71 |
| 44905.947916666664 | 31.76 |
| 44905.958333333336 | 31.85 |
| 44905.96875 | 31.87 |
| 44905.979166666664 | 31.93 |
| 44905.989583333336 | 32 |
| 44906.0 | 32.04 |
| 44906.010416666664 | 32.07 |
| 44906.020833333336 | 32.08 |
| 44906.03125 | 32.09 |
| 44906.041666666664 | 32.11 |
| 44906.052083333336 | 32.13 |
| 44906.0625 | 32.14 |
| 44906.072916666664 | 32.14 |
| 44906.083333333336 | 32.13 |
| 44906.09375 | 32.13 |
| 44906.104166666664 | 32.13 |
| 44906.114583333336 | 32.13 |
| 44906.125 | 32.13 |
| 44906.135416666664 | 32.14 |
| 44906.145833333336 | 32.14 |
| 44906.15625 | 32.11 |
| 44906.166666666664 | 32.1 |
| 44906.177083333336 | 32.11 |
| 44906.1875 | 32.11 |
| 44906.197916666664 | 32.11 |
| 44906.208333333336 | 32.07 |
| 44906.21875 | 32.11 |
| 44906.229166666664 | 32.07 |
| 44906.239583333336 | 32.07 |
| 44906.25 | 32.08 |
| 44906.260416666664 | 32.05 |
| 44906.270833333336 | 32.04 |
| 44906.28125 | 32.01 |
| 44906.291666666664 | 32 |
| 44906.302083333336 | 32.04 |
| 44906.3125 | 31.99 |
| 44906.322916666664 | 32.01 |
| 44906.333333333336 | 31.95 |
| 44906.34375 | 31.93 |
| 44906.354166666664 | 31.88 |
| 44906.364583333336 | 31.86 |
| 44906.375 | 31.81 |
| 44906.385416666664 | 31.8 |
| 44906.395833333336 | 31.84 |
| 44906.40625 | 31.84 |
| 44906.416666666664 | 31.84 |
| 44906.427083333336 | 31.85 |
| 44906.4375 | 31.86 |
| 44906.447916666664 | 31.92 |
| 44906.458333333336 | 31.96 |
| 44906.46875 | 32.01 |
| 44906.479166666664 | 32.06 |
| 44906.489583333336 | 32.09 |
| 44906.5 | 32.1 |
| 44906.510416666664 | 32.12 |
| 44906.520833333336 | 32.12 |
| 44906.53125 | 32.13 |
| 44906.541666666664 | 32.12 |
| 44906.552083333336 | 32.11 |
| 44906.5625 | 32.11 |
| 44906.572916666664 | 32.11 |
| 44906.583333333336 | 32.11 |
| 44906.59375 | 32.1 |
| 44906.604166666664 | 32.1 |
| 44906.614583333336 | 32.12 |
| 44906.625 | 32.13 |
| 44906.635416666664 | 32.15 |
| 44906.645833333336 | 32.16 |
| 44906.65625 | 32.17 |
| 44906.666666666664 | 32.15 |
| 44906.677083333336 | 32.08 |
| 44906.6875 | 32.1 |
| 44906.697916666664 | 32.11 |
| 44906.708333333336 | 32.14 |
| 44906.71875 | 32.13 |
| 44906.729166666664 | 32.15 |
| 44906.739583333336 | 32.16 |
| 44906.75 | 32.11 |
| 44906.760416666664 | 32.1 |
| 44906.770833333336 | 32.09 |
| 44906.78125 | 32.08 |
| 44906.791666666664 | 32.08 |
| 44906.802083333336 | 32.06 |
| 44906.8125 | 32.05 |
| 44906.822916666664 | 32.04 |
| 44906.833333333336 | 32.05 |
| 44906.84375 | 32.02 |
| 44906.854166666664 | 32.02 |
| 44906.864583333336 | 32 |
| 44906.875 | 31.99 |
| 44906.885416666664 | 31.99 |
| 44906.895833333336 | 31.97 |
| 44906.90625 | 31.94 |
| 44906.916666666664 | 31.93 |
| 44906.927083333336 | 31.74 |
| 44906.9375 | 31.79 |
| 44906.947916666664 | 31.89 |
| 44906.958333333336 | 31.85 |
| 44906.96875 | 31.82 |
| 44906.979166666664 | 31.84 |
| 44906.989583333336 | 31.89 |
| 44907.0 | 31.94 |
| 44907.010416666664 | 31.97 |
| 44907.020833333336 | 32.04 |
| 44907.03125 | 32.11 |
| 44907.041666666664 | 32.16 |
| 44907.052083333336 | 32.16 |
| 44907.0625 | 32.17 |
| 44907.072916666664 | 32.17 |
| 44907.083333333336 | 32.2 |
| 44907.09375 | 32.13 |
| 44907.104166666664 | 32.16 |
| 44907.114583333336 | 32.17 |
| 44907.125 | 32.13 |
| 44907.135416666664 | 32.13 |
| 44907.145833333336 | 32.12 |
| 44907.15625 | 32.12 |
| 44907.166666666664 | 32.09 |
| 44907.177083333336 | 32.09 |
| 44907.1875 | 32.11 |
| 44907.197916666664 | 32.11 |
| 44907.208333333336 | 32.1 |
| 44907.21875 | 32.08 |
| 44907.229166666664 | 32.1 |
| 44907.239583333336 | 32.09 |
| 44907.25 | 32.04 |
| 44907.260416666664 | 32.01 |
| 44907.270833333336 | 32.01 |
| 44907.28125 | 31.96 |
| 44907.291666666664 | 31.99 |
| 44907.302083333336 | 31.98 |
| 44907.3125 | 31.97 |
| 44907.322916666664 | 32.01 |
| 44907.333333333336 | 31.94 |
| 44907.34375 | 31.91 |
| 44907.354166666664 | 31.84 |
| 44907.364583333336 | 31.8 |
| 44907.375 | 31.76 |
| 44907.385416666664 | 31.73 |
| 44907.395833333336 | 31.72 |
| 44907.40625 | 31.71 |
| 44907.416666666664 | 31.78 |
| 44907.427083333336 | 31.74 |
| 44907.4375 | 31.84 |
| 44907.447916666664 | 31.78 |
| 44907.458333333336 | 31.8 |
| 44907.46875 | 31.89 |
| 44907.479166666664 | 31.91 |
| 44907.489583333336 | 32 |
| 44907.5 | 32.06 |
| 44907.510416666664 | 32.08 |
| 44907.520833333336 | 32.08 |
| 44907.53125 | 32.08 |
| 44907.541666666664 | 32.13 |
| 44907.552083333336 | 32.07 |
| 44907.5625 | 32.15 |
| 44907.572916666664 | 32.12 |
| 44907.583333333336 | 32.17 |
| 44907.59375 | 32.1 |
| 44907.604166666664 | 32.09 |
| 44907.614583333336 | 32.16 |
| 44907.625 | 32.18 |
| 44907.635416666664 | 32.08 |
| 44907.645833333336 | 32.2 |
| 44907.65625 | 32.16 |
| 44907.666666666664 | 32.14 |
| 44907.677083333336 | 32.18 |
| 44907.6875 | 32.25 |
| 44907.697916666664 | 32.12 |
| 44907.708333333336 | 32.2 |
| 44907.71875 | 32.23 |
| 44907.729166666664 | 32.22 |
| 44907.739583333336 | 32.25 |
| 44907.75 | 32.24 |
| 44907.760416666664 | 32.21 |
| 44907.770833333336 | 32.2 |
| 44907.78125 | 32.12 |
| 44907.791666666664 | 32.09 |
| 44907.802083333336 | 32.18 |
| 44907.8125 | 32.12 |
| 44907.822916666664 | 32.06 |
| 44907.833333333336 | 32.14 |
| 44907.84375 | 32.12 |
| 44907.854166666664 | 32.05 |
| 44907.864583333336 | 32.06 |
| 44907.875 | 32.05 |
| 44907.885416666664 | 32.06 |
| 44907.895833333336 | 32.09 |
| 44907.90625 | 32.08 |
| 44907.916666666664 | 32.07 |
| 44907.927083333336 | 32 |
| 44907.9375 | 31.98 |
| 44907.947916666664 | 32.01 |
| 44907.958333333336 | 31.94 |
| 44907.96875 | 31.95 |
| 44907.979166666664 | 31.9 |
| 44907.989583333336 | 31.94 |
| 44908.0 | 32 |
| 44908.010416666664 | 31.99 |
| 44908.020833333336 | 31.92 |
| 44908.03125 | 32.04 |
| 44908.041666666664 | 32.08 |
| 44908.052083333336 | 32.15 |
| 44908.0625 | 32.21 |
| 44908.072916666664 | 32.29 |
| 44908.083333333336 | 32.31 |
| 44908.09375 | 32.31 |
| 44908.104166666664 | 32.31 |
| 44908.114583333336 | 32.31 |
| 44908.125 | 32.31 |
| 44908.135416666664 | 32.3 |
| 44908.145833333336 | 32.31 |
| 44908.15625 | 32.31 |
| 44908.166666666664 | 32.31 |
| 44908.177083333336 | 32.32 |
| 44908.1875 | 32.31 |
| 44908.197916666664 | 32.3 |
| 44908.208333333336 | 32.28 |
| 44908.21875 | 32.3 |
| 44908.229166666664 | 32.31 |
| 44908.239583333336 | 32.31 |
| 44908.25 | 32.31 |
| 44908.260416666664 | 32.31 |
| 44908.270833333336 | 32.29 |
| 44908.28125 | 32.3 |
| 44908.291666666664 | 32.3 |
| 44908.302083333336 | 32.29 |
| 44908.3125 | 32.28 |
| 44908.322916666664 | 32.25 |
| 44908.333333333336 | 32.22 |
| 44908.34375 | 32.27 |
| 44908.354166666664 | 32.2 |
| 44908.364583333336 | 32.14 |
| 44908.375 | 32.16 |
| 44908.385416666664 | 32.18 |
| 44908.395833333336 | 32.06 |
| 44908.40625 | 32.07 |
| 44908.416666666664 | 31.94 |
| 44908.427083333336 | 31.93 |
| 44908.4375 | 31.88 |
| 44908.447916666664 | 31.86 |
| 44908.458333333336 | 31.82 |
| 44908.46875 | 31.86 |
| 44908.479166666664 | 31.84 |
| 44908.489583333336 | 31.84 |
| 44908.5 | 31.85 |
| 44908.510416666664 | 31.91 |
| 44908.520833333336 | 31.99 |
| 44908.53125 | 32.05 |
| 44908.541666666664 | 32.07 |
| 44908.552083333336 | 32.12 |
| 44908.5625 | 32.13 |
| 44908.572916666664 | 32.14 |
| 44908.583333333336 | 32.17 |
| 44908.59375 | 32.16 |
| 44908.604166666664 | 32.14 |
| 44908.614583333336 | 32.16 |
| 44908.625 | 32.16 |
| 44908.635416666664 | 32.19 |
| 44908.645833333336 | 32.2 |
| 44908.65625 | 32.19 |
| 44908.666666666664 | 32.18 |
| 44908.677083333336 | 32.16 |
| 44908.6875 | 32.19 |
| 44908.697916666664 | 32.21 |
| 44908.708333333336 | 32.21 |
| 44908.71875 | 32.21 |
| 44908.729166666664 | 32.22 |
| 44908.739583333336 | 32.22 |
| 44908.75 | 32.26 |
| 44908.760416666664 | 32.26 |
| 44908.770833333336 | 32.26 |
| 44908.78125 | 32.27 |
| 44908.791666666664 | 32.23 |
| 44908.802083333336 | 32.25 |
| 44908.8125 | 32.25 |
| 44908.822916666664 | 32.23 |
| 44908.833333333336 | 32.22 |
| 44908.84375 | 32.19 |
| 44908.854166666664 | 32.18 |
| 44908.864583333336 | 32.17 |
| 44908.875 | 32.19 |
| 44908.885416666664 | 32.18 |
| 44908.895833333336 | 32.15 |
| 44908.90625 | 32.15 |
| 44908.916666666664 | 32.14 |
| 44908.927083333336 | 32.12 |
| 44908.9375 | 32.03 |
| 44908.947916666664 | 31.96 |
| 44908.958333333336 | 31.99 |
| 44908.96875 | 31.97 |
| 44908.979166666664 | 31.93 |
| 44908.989583333336 | 31.91 |
| 44909.0 | 31.94 |
| 44909.010416666664 | 31.97 |
| 44909.020833333336 | 31.97 |
| 44909.03125 | 31.97 |
| 44909.041666666664 | 31.93 |
| 44909.052083333336 | 31.96 |
| 44909.0625 | 32.04 |
| 44909.072916666664 | 32.06 |
| 44909.083333333336 | 32.06 |
| 44909.09375 | 32.16 |
| 44909.104166666664 | 32.23 |
| 44909.114583333336 | 32.24 |
| 44909.125 | 32.22 |
| 44909.135416666664 | 32.25 |
| 44909.145833333336 | 32.27 |
| 44909.15625 | 32.25 |
| 44909.166666666664 | 32.28 |
| 44909.177083333336 | 32.14 |
| 44909.1875 | 32.27 |
| 44909.197916666664 | 32.18 |
| 44909.208333333336 | 32.22 |
| 44909.21875 | 32.26 |
| 44909.229166666664 | 32.2 |
| 44909.239583333336 | 32.12 |
| 44909.25 | 32.16 |
| 44909.260416666664 | 32.24 |
| 44909.270833333336 | 32.2 |
| 44909.28125 | 32.24 |
| 44909.291666666664 | 32.24 |
| 44909.302083333336 | 32.27 |
| 44909.3125 | 32.21 |
| 44909.322916666664 | 32.21 |
| 44909.333333333336 | 32.1 |
| 44909.34375 | 32.13 |
| 44909.354166666664 | 32.15 |
| 44909.364583333336 | 32.03 |
| 44909.375 | 31.9 |
| 44909.385416666664 | 32.05 |
| 44909.395833333336 | 32.02 |
| 44909.40625 | 31.95 |
| 44909.416666666664 | 31.92 |
| 44909.427083333336 | 31.92 |
| 44909.4375 | 31.96 |
| 44909.447916666664 | 31.81 |
| 44909.458333333336 | 31.76 |
| 44909.46875 | 31.62 |
| 44909.479166666664 | 31.66 |
| 44909.489583333336 | 31.64 |
| 44909.5 | 31.59 |
| 44909.510416666664 | 31.71 |
| 44909.520833333336 | 31.75 |
| 44909.53125 | 31.84 |
| 44909.541666666664 | 31.81 |
| 44909.552083333336 | 31.94 |
| 44909.5625 | 32.05 |
| 44909.572916666664 | 32.03 |
| 44909.583333333336 | 32.12 |
| 44909.59375 | 32.09 |
| 44909.604166666664 | 32.1 |
| 44909.614583333336 | 32.1 |
| 44909.625 | 32.13 |
| 44909.635416666664 | 32.17 |
| 44909.645833333336 | 32.17 |
| 44909.65625 | 32.18 |
| 44909.666666666664 | 32.24 |
| 44909.677083333336 | 32.24 |
| 44909.6875 | 32.19 |
| 44909.697916666664 | 32.22 |
| 44909.708333333336 | 32.22 |
| 44909.71875 | 32.2 |
| 44909.729166666664 | 32.21 |
| 44909.739583333336 | 32.14 |
| 44909.75 | 32.17 |
| 44909.760416666664 | 32.19 |
| 44909.770833333336 | 32.18 |
| 44909.78125 | 32.23 |
| 44909.791666666664 | 32.17 |
| 44909.802083333336 | 32.16 |
| 44909.8125 | 32.19 |
| 44909.822916666664 | 32.16 |
| 44909.833333333336 | 32.19 |
| 44909.84375 | 32.18 |
| 44909.854166666664 | 32.17 |
| 44909.864583333336 | 32.15 |
| 44909.875 | 32.13 |
| 44909.885416666664 | 32.14 |
| 44909.895833333336 | 32.09 |
| 44909.90625 | 32.07 |
| 44909.916666666664 | 32.06 |
| 44909.927083333336 | 32.05 |
| 44909.9375 | 32.01 |
| 44909.947916666664 | 31.9 |
| 44909.958333333336 | 31.88 |
| 44909.96875 | 31.87 |
| 44909.979166666664 | 31.82 |
| 44909.989583333336 | 31.77 |
| 44910.0 | 31.75 |
| 44910.010416666664 | 31.72 |
| 44910.020833333336 | 31.72 |
| 44910.03125 | 31.82 |
| 44910.041666666664 | 31.78 |
| 44910.052083333336 | 31.8 |
| 44910.0625 | 31.83 |
| 44910.072916666664 | 31.89 |
| 44910.083333333336 | 31.99 |
| 44910.09375 | 31.97 |
| 44910.104166666664 | 32.05 |
| 44910.114583333336 | 32.15 |
| 44910.125 | 32.18 |
| 44910.135416666664 | 32.25 |
| 44910.145833333336 | 32.25 |
| 44910.15625 | 32.25 |
| 44910.166666666664 | 32.17 |
| 44910.177083333336 | 32.17 |
| 44910.1875 | 32.19 |
| 44910.197916666664 | 32.19 |
| 44910.208333333336 | 32.19 |
| 44910.21875 | 32.2 |
| 44910.229166666664 | 32.27 |
| 44910.239583333336 | 32.18 |
| 44910.25 | 32.17 |
| 44910.260416666664 | 32.21 |
| 44910.270833333336 | 32.15 |
| 44910.28125 | 32.16 |
| 44910.291666666664 | 32.17 |
| 44910.302083333336 | 32.18 |
| 44910.3125 | 32.19 |
| 44910.322916666664 | 32.2 |
| 44910.333333333336 | 32.19 |
| 44910.34375 | 32.12 |
| 44910.354166666664 | 32.21 |
| 44910.364583333336 | 32.16 |
| 44910.375 | 32.09 |
| 44910.385416666664 | 32.11 |
| 44910.395833333336 | 32.09 |
| 44910.40625 | 32.01 |
| 44910.416666666664 | 32.01 |
| 44910.427083333336 | 32.04 |
| 44910.4375 | 32.01 |
| 44910.447916666664 | 31.91 |
| 44910.458333333336 | 31.89 |
| 44910.46875 | 31.86 |
| 44910.479166666664 | 31.81 |
| 44910.489583333336 | 31.74 |
| 44910.5 | 31.6 |
| 44910.510416666664 | 31.61 |
| 44910.520833333336 | 31.48 |
| 44910.53125 | 31.53 |
| 44910.541666666664 | 31.54 |
| 44910.552083333336 | 31.65 |
| 44910.5625 | 31.56 |
| 44910.572916666664 | 31.69 |
| 44910.583333333336 | 31.84 |
| 44910.59375 | 31.9 |
| 44910.604166666664 | 31.96 |
| 44910.614583333336 | 31.96 |
| 44910.625 | 31.98 |
| 44910.635416666664 | 31.98 |
| 44910.645833333336 | 31.91 |
| 44910.65625 | 31.92 |
| 44910.666666666664 | 32.02 |
| 44910.677083333336 | 31.99 |
| 44910.6875 | 31.99 |
| 44910.697916666664 | 32.02 |
| 44910.708333333336 | 31.97 |
| 44910.71875 | 32.01 |
| 44910.729166666664 | 31.98 |
| 44910.739583333336 | 32.04 |
| 44910.75 | 31.98 |
| 44910.760416666664 | 31.88 |
| 44910.770833333336 | 31.76 |
| 44910.78125 | 31.75 |
| 44910.791666666664 | 31.68 |
| 44910.802083333336 | 31.66 |
| 44910.8125 | 31.11 |
| 44910.822916666664 | 31.1 |
| 44910.833333333336 | 31.16 |
| 44910.84375 | 30.77 |
| 44910.854166666664 | 30.87 |
| 44910.864583333336 | 31.1 |
| 44910.875 | 31.06 |
| 44910.885416666664 | 30.85 |
| 44910.895833333336 | 30.83 |
| 44910.90625 | 30.74 |
| 44910.916666666664 | 30.71 |
| 44910.927083333336 | 30.61 |
| 44910.9375 | 30.61 |
| 44910.947916666664 | 30.59 |
| 44910.958333333336 | 30.53 |
| 44910.96875 | 30.6 |
| 44910.979166666664 | 30.6 |
| 44910.989583333336 | 30.39 |
| 44911.0 | 30.48 |
| 44911.010416666664 | 30.13 |
| 44911.020833333336 | 30.37 |
| 44911.03125 | 30.2 |
| 44911.041666666664 | 30.06 |
| 44911.052083333336 | 30.32 |
| 44911.0625 | 30.59 |
| 44911.072916666664 | 30.65 |
| 44911.083333333336 | 30.57 |
| 44911.09375 | 30.49 |
| 44911.104166666664 | 30.53 |
| 44911.114583333336 | 30.59 |
| 44911.125 | 30.32 |
| 44911.135416666664 | 30.08 |
| 44911.145833333336 | 30.15 |
| 44911.15625 | 30.51 |
| 44911.166666666664 | 30.47 |
| 44911.177083333336 | 30.51 |
| 44911.1875 | 30.63 |
| 44911.197916666664 | 30.68 |
| 44911.208333333336 | 30.77 |
| 44911.21875 | 30.87 |
| 44911.229166666664 | 30.95 |
| 44911.239583333336 | 31.05 |
| 44911.25 | 31.13 |
| 44911.260416666664 | 31.18 |
| 44911.270833333336 | 31.2 |
| 44911.28125 | 31.21 |
| 44911.291666666664 | 31.2 |
| 44911.302083333336 | 31.15 |
| 44911.3125 | 31.19 |
| 44911.322916666664 | 31.17 |
| 44911.333333333336 | 31.11 |
| 44911.34375 | 31.04 |
| 44911.354166666664 | 30.95 |
| 44911.364583333336 | 30.76 |
| 44911.375 | 30.65 |
| 44911.385416666664 | 30.58 |
| 44911.395833333336 | 30.43 |
| 44911.40625 | 30.32 |
| 44911.416666666664 | 30.24 |
| 44911.427083333336 | 30.26 |
| 44911.4375 | 30.15 |
| 44911.447916666664 | 30.16 |
| 44911.458333333336 | 30.23 |
| 44911.46875 | 30.21 |
| 44911.479166666664 | 30.14 |
| 44911.489583333336 | 30.1 |
| 44911.5 | 30.15 |
| 44911.510416666664 | 30.06 |
| 44911.520833333336 | 29.98 |
| 44911.53125 | 29.91 |
| 44911.541666666664 | 29.84 |
| 44911.552083333336 | 29.84 |
| 44911.5625 | 29.88 |
| 44911.572916666664 | 29.97 |
| 44911.583333333336 | 30.01 |
| 44911.59375 | 30.03 |
| 44911.604166666664 | 30.05 |
| 44911.614583333336 | 30.08 |
| 44911.625 | 30.22 |
| 44911.635416666664 | 30.32 |
| 44911.645833333336 | 30.49 |
| 44911.65625 | 30.65 |
| 44911.666666666664 | 30.76 |
| 44911.677083333336 | 30.75 |
| 44911.6875 | 30.73 |
| 44911.697916666664 | 30.74 |
| 44911.708333333336 | 30.72 |
| 44911.71875 | 30.73 |
| 44911.729166666664 | 30.74 |
| 44911.739583333336 | 30.76 |
| 44911.75 | 30.79 |
| 44911.760416666664 | 30.84 |
| 44911.770833333336 | 30.87 |
| 44911.78125 | 30.92 |
| 44911.791666666664 | 30.98 |
| 44911.802083333336 | 31.11 |
| 44911.8125 | 31.18 |
| 44911.822916666664 | 31.24 |
| 44911.833333333336 | 31.29 |
| 44911.84375 | 31.36 |
| 44911.854166666664 | 31.29 |
| 44911.864583333336 | 31.29 |
| 44911.875 | 31.18 |
| 44911.885416666664 | 31.08 |
| 44911.895833333336 | 31.01 |
| 44911.90625 | 30.9 |
| 44911.916666666664 | 30.82 |
| 44911.927083333336 | 30.87 |
| 44911.9375 | 30.81 |
| 44911.947916666664 | 30.53 |
| 44911.958333333336 | 30.42 |
| 44911.96875 | 30.27 |
| 44911.979166666664 | 30.35 |
| 44911.989583333336 | 30.39 |
| 44912.0 | 30.41 |
| 44912.010416666664 | 30.06 |
| 44912.020833333336 | 29.77 |
| 44912.03125 | 29.44 |
| 44912.041666666664 | 29.13 |
| 44912.052083333336 | 28.89 |
| 44912.0625 | 28.86 |
| 44912.072916666664 | 28.66 |
| 44912.083333333336 | 28.49 |
| 44912.09375 | 28.67 |
| 44912.104166666664 | 28.92 |
| 44912.114583333336 | 29.09 |
| 44912.125 | 29.17 |
| 44912.135416666664 | 29.54 |
| 44912.145833333336 | 29.81 |
| 44912.15625 | 30.2 |
| 44912.166666666664 | 30.59 |
| 44912.177083333336 | 30.89 |
| 44912.1875 | 30.93 |
| 44912.197916666664 | 31.01 |
| 44912.208333333336 | 31.02 |
| 44912.21875 | 31.07 |
| 44912.229166666664 | 31.1 |
| 44912.239583333336 | 31.09 |
| 44912.25 | 31.08 |
| 44912.260416666664 | 31.08 |
| 44912.270833333336 | 31.14 |
| 44912.28125 | 31.17 |
| 44912.291666666664 | 31.19 |
| 44912.302083333336 | 31.2 |
| 44912.3125 | 31.17 |
| 44912.322916666664 | 31.19 |
| 44912.333333333336 | 31.24 |
| 44912.34375 | 31.23 |
| 44912.354166666664 | 31.24 |
| 44912.364583333336 | 31.17 |
| 44912.375 | 31.04 |
| 44912.385416666664 | 31.16 |
| 44912.395833333336 | 31.11 |
| 44912.40625 | 31.03 |
| 44912.416666666664 | 31.05 |
| 44912.427083333336 | 31.06 |
| 44912.4375 | 31.02 |
| 44912.447916666664 | 30.96 |
| 44912.458333333336 | 30.95 |
| 44912.46875 | 30.54 |
| 44912.479166666664 | 30.47 |
| 44912.489583333336 | 30.41 |
| 44912.5 | 30.39 |
| 44912.510416666664 | 30.33 |
| 44912.520833333336 | 30.03 |
| 44912.53125 | 30 |
| 44912.541666666664 | 29.75 |
| 44912.552083333336 | 29.59 |
| 44912.5625 | 29.4 |
| 44912.572916666664 | 29.22 |
| 44912.583333333336 | 29.06 |
| 44912.59375 | 29.05 |
| 44912.604166666664 | 29.12 |
| 44912.614583333336 | 29.23 |
| 44912.625 | 29.33 |
| 44912.635416666664 | 29.35 |
| 44912.645833333336 | 29.5 |
| 44912.65625 | 29.71 |
| 44912.666666666664 | 29.83 |
| 44912.677083333336 | 30.05 |
| 44912.6875 | 30.35 |
| 44912.697916666664 | 30.67 |
| 44912.708333333336 | 30.87 |
| 44912.71875 | 31.03 |
| 44912.729166666664 | 31.09 |
| 44912.739583333336 | 31.04 |
| 44912.75 | 31.1 |
| 44912.760416666664 | 31.13 |
| 44912.770833333336 | 31.11 |
| 44912.78125 | 31.12 |
| 44912.791666666664 | 31.12 |
| 44912.802083333336 | 31.07 |
| 44912.8125 | 31.05 |
| 44912.822916666664 | 31.07 |
| 44912.833333333336 | 31.08 |
| 44912.84375 | 31.05 |
| 44912.854166666664 | 31.03 |
| 44912.864583333336 | 31.05 |
| 44912.875 | 31.11 |
| 44912.885416666664 | 31.09 |
| 44912.895833333336 | 31.08 |
| 44912.90625 | 31 |
| 44912.916666666664 | 30.94 |
| 44912.927083333336 | 30.97 |
| 44912.9375 | 30.95 |
| 44912.947916666664 | 30.99 |
| 44912.958333333336 | 30.92 |
| 44912.96875 | 30.57 |
| 44912.979166666664 | 30.32 |
| 44912.989583333336 | 30.42 |
| 44913.0 | 30.11 |
| 44913.010416666664 | 29.88 |
| 44913.020833333336 | 29.65 |
| 44913.03125 | 29.08 |
| 44913.041666666664 | 28.63 |
| 44913.052083333336 | 28.32 |
| 44913.0625 | 27.96 |
| 44913.072916666664 | 27.73 |
| 44913.083333333336 | 27.58 |
| 44913.09375 | 27.58 |
| 44913.104166666664 | 27.49 |
| 44913.114583333336 | 27.55 |
| 44913.125 | 27.74 |
| 44913.135416666664 | 28 |
| 44913.145833333336 | 28.16 |
| 44913.15625 | 28.38 |
| 44913.166666666664 | 28.65 |
| 44913.177083333336 | 29.15 |
| 44913.1875 | 29.72 |
| 44913.197916666664 | 30.22 |
| 44913.208333333336 | 30.47 |
| 44913.21875 | 30.55 |
| 44913.229166666664 | 30.6 |
| 44913.239583333336 | 30.72 |
| 44913.25 | 30.75 |
| 44913.260416666664 | 30.78 |
| 44913.270833333336 | 30.78 |
| 44913.28125 | 30.9 |
| 44913.291666666664 | 30.91 |
| 44913.302083333336 | 30.93 |
| 44913.3125 | 30.95 |
| 44913.322916666664 | 30.96 |
| 44913.333333333336 | 30.99 |
| 44913.34375 | 31.1 |
| 44913.354166666664 | 31.09 |
| 44913.364583333336 | 31.1 |
| 44913.375 | 31.11 |
| 44913.385416666664 | 31.16 |
| 44913.395833333336 | 31.2 |
| 44913.40625 | 31.09 |
| 44913.416666666664 | 31.08 |
| 44913.427083333336 | 31.06 |
| 44913.4375 | 31.06 |
| 44913.447916666664 | 31.02 |
| 44913.458333333336 | 30.94 |
| 44913.46875 | 31 |
| 44913.479166666664 | 30.9 |
| 44913.489583333336 | 30.84 |
| 44913.5 | 30.44 |
| 44913.510416666664 | 30.28 |
| 44913.520833333336 | 30.08 |
| 44913.53125 | 30.01 |
| 44913.541666666664 | 29.89 |
| 44913.552083333336 | 29.51 |
| 44913.5625 | 29.17 |
| 44913.572916666664 | 28.9 |
| 44913.583333333336 | 28.79 |
| 44913.59375 | 28.59 |
| 44913.604166666664 | 28.55 |
| 44913.614583333336 | 28.5 |
| 44913.625 | 28.52 |
| 44913.635416666664 | 28.45 |
| 44913.645833333336 | 28.45 |
| 44913.65625 | 28.64 |
| 44913.666666666664 | 28.73 |
| 44913.677083333336 | 28.93 |
| 44913.6875 | 29.06 |
| 44913.697916666664 | 29.16 |
| 44913.708333333336 | 29.54 |
| 44913.71875 | 29.85 |
| 44913.729166666664 | 30.1 |
| 44913.739583333336 | 30.42 |
| 44913.75 | 30.62 |
| 44913.760416666664 | 30.59 |
| 44913.770833333336 | 30.61 |
| 44913.78125 | 30.71 |
| 44913.791666666664 | 30.8 |
| 44913.802083333336 | 30.87 |
| 44913.8125 | 30.9 |
| 44913.822916666664 | 30.94 |
| 44913.833333333336 | 30.97 |
| 44913.84375 | 31.04 |
| 44913.854166666664 | 31.06 |
| 44913.864583333336 | 31.05 |
| 44913.875 | 31.08 |
| 44913.885416666664 | 31.05 |
| 44913.895833333336 | 31.13 |
| 44913.90625 | 31.15 |
| 44913.916666666664 | 31.22 |
| 44913.927083333336 | 31.15 |
| 44913.9375 | 31.12 |
| 44913.947916666664 | 31.11 |
| 44913.958333333336 | 31.07 |
| 44913.96875 | 31.06 |
| 44913.979166666664 | 30.93 |
| 44913.989583333336 | 30.91 |
| 44914.0 | 30.8 |
| 44914.010416666664 | 30.89 |
| 44914.020833333336 | 30.76 |
| 44914.03125 | 30.62 |
| 44914.041666666664 | 30.34 |
| 44914.052083333336 | 30.15 |
| 44914.0625 | 29.79 |
| 44914.072916666664 | 29.69 |
| 44914.083333333336 | 29.4 |
| 44914.09375 | 29.24 |
| 44914.104166666664 | 29.07 |
| 44914.114583333336 | 28.94 |
| 44914.125 | 28.93 |
| 44914.135416666664 | 28.9 |
| 44914.145833333336 | 28.91 |
| 44914.15625 | 28.95 |
| 44914.166666666664 | 29.19 |
| 44914.177083333336 | 29.18 |
| 44914.1875 | 29.25 |
| 44914.197916666664 | 29.34 |
| 44914.208333333336 | 29.61 |
| 44914.21875 | 29.94 |
| 44914.229166666664 | 30.25 |
| 44914.239583333336 | 30.5 |
| 44914.25 | 30.6 |
| 44914.260416666664 | 30.7 |
| 44914.270833333336 | 30.86 |
| 44914.28125 | 30.89 |
| 44914.291666666664 | 30.95 |
| 44914.302083333336 | 30.98 |
| 44914.3125 | 31.06 |
| 44914.322916666664 | 31.03 |
| 44914.333333333336 | 31.03 |
| 44914.34375 | 31.05 |
| 44914.354166666664 | 31.06 |
| 44914.364583333336 | 31.08 |
| 44914.375 | 31.12 |
| 44914.385416666664 | 31.16 |
| 44914.395833333336 | 31.15 |
| 44914.40625 | 31.19 |
| 44914.416666666664 | 31.17 |
| 44914.427083333336 | 31.1 |
| 44914.4375 | 31.08 |
| 44914.447916666664 | 31.12 |
| 44914.458333333336 | 31.17 |
| 44914.46875 | 31.08 |
| 44914.479166666664 | 31.14 |
| 44914.489583333336 | 31.08 |
| 44914.5 | 31.03 |
| 44914.510416666664 | 31 |
| 44914.520833333336 | 30.97 |
| 44914.53125 | 30.99 |
| 44914.541666666664 | 30.81 |
| 44914.552083333336 | 30.62 |
| 44914.5625 | 30.68 |
| 44914.572916666664 | 30.59 |
| 44914.583333333336 | 30.35 |
| 44914.59375 | 30.19 |
| 44914.604166666664 | 29.96 |
| 44914.614583333336 | 29.66 |
| 44914.625 | 29.42 |
| 44914.635416666664 | 29.23 |
| 44914.645833333336 | 29.11 |
| 44914.65625 | 28.97 |
| 44914.666666666664 | 28.92 |
| 44914.677083333336 | 28.97 |
| 44914.6875 | 28.99 |
| 44914.697916666664 | 29.11 |
| 44914.708333333336 | 29.19 |
| 44914.71875 | 29.27 |
| 44914.729166666664 | 29.45 |
| 44914.739583333336 | 29.77 |
| 44914.75 | 30.1 |
| 44914.760416666664 | 30.37 |
| 44914.770833333336 | 30.51 |
| 44914.78125 | 30.63 |
| 44914.791666666664 | 30.71 |
| 44914.802083333336 | 30.75 |
| 44914.8125 | 30.77 |
| 44914.822916666664 | 30.82 |
| 44914.833333333336 | 30.89 |
| 44914.84375 | 30.95 |
| 44914.854166666664 | 31.01 |
| 44914.864583333336 | 31.04 |
| 44914.875 | 31.07 |
| 44914.885416666664 | 31.09 |
| 44914.895833333336 | 31.12 |
| 44914.90625 | 31.15 |
| 44914.916666666664 | 31.17 |
| 44914.927083333336 | 31.18 |
| 44914.9375 | 31.26 |
| 44914.947916666664 | 31.14 |
| 44914.958333333336 | 31.16 |
| 44914.96875 | 31.09 |
| 44914.979166666664 | 31.08 |
| 44914.989583333336 | 31.07 |
| 44915.0 | 31.04 |
| 44915.010416666664 | 31.03 |
| 44915.020833333336 | 30.98 |
| 44915.03125 | 30.92 |
| 44915.041666666664 | 30.79 |
| 44915.052083333336 | 30.59 |
| 44915.0625 | 30.43 |
| 44915.072916666664 | 30.22 |
| 44915.083333333336 | 29.98 |
| 44915.09375 | 29.69 |
| 44915.104166666664 | 29.5 |
| 44915.114583333336 | 29.29 |
| 44915.125 | 29.14 |
| 44915.135416666664 | 29.03 |
| 44915.145833333336 | 28.92 |
| 44915.15625 | 28.84 |
| 44915.166666666664 | 28.86 |
| 44915.177083333336 | 28.94 |
| 44915.1875 | 29.04 |
| 44915.197916666664 | 29.09 |
| 44915.208333333336 | 29.13 |
| 44915.21875 | 29.24 |
| 44915.229166666664 | 29.43 |
| 44915.239583333336 | 29.71 |
| 44915.25 | 30.19 |
| 44915.260416666664 | 30.48 |
| 44915.270833333336 | 30.62 |
| 44915.28125 | 30.64 |
| 44915.291666666664 | 30.7 |
| 44915.302083333336 | 30.79 |
| 44915.3125 | 30.89 |
| 44915.322916666664 | 30.98 |
| 44915.333333333336 | 31.06 |
| 44915.34375 | 31.1 |
| 44915.354166666664 | 31.11 |
| 44915.364583333336 | 31.18 |
| 44915.375 | 31.26 |
| 44915.385416666664 | 31.3 |
| 44915.395833333336 | 31.34 |
| 44915.40625 | 31.37 |
| 44915.416666666664 | 31.37 |
| 44915.427083333336 | 31.38 |
| 44915.4375 | 31.4 |
| 44915.447916666664 | 31.39 |
| 44915.458333333336 | 31.34 |
| 44915.46875 | 31.32 |
| 44915.479166666664 | 31.32 |
| 44915.489583333336 | 31.33 |
| 44915.5 | 31.3 |
| 44915.510416666664 | 31.28 |
| 44915.520833333336 | 31.24 |
| 44915.53125 | 31.23 |
| 44915.541666666664 | 31.23 |
| 44915.552083333336 | 31.2 |
| 44915.5625 | 31.14 |
| 44915.572916666664 | 31.06 |
| 44915.583333333336 | 30.95 |
| 44915.59375 | 30.92 |
| 44915.604166666664 | 30.9 |
| 44915.614583333336 | 30.86 |
| 44915.625 | 30.56 |
| 44915.635416666664 | 30.5 |
| 44915.645833333336 | 30.23 |
| 44915.65625 | 29.86 |
| 44915.666666666664 | 29.7 |
| 44915.677083333336 | 29.59 |
| 44915.6875 | 29.51 |
| 44915.697916666664 | 29.41 |
| 44915.708333333336 | 29.36 |
| 44915.71875 | 29.33 |
| 44915.729166666664 | 29.45 |
| 44915.739583333336 | 29.51 |
| 44915.75 | 29.52 |
| 44915.760416666664 | 29.56 |
| 44915.770833333336 | 29.66 |
| 44915.78125 | 29.77 |
| 44915.791666666664 | 30.11 |
| 44915.802083333336 | 30.39 |
| 44915.8125 | 30.67 |
| 44915.822916666664 | 30.69 |
| 44915.833333333336 | 30.71 |
| 44915.84375 | 30.77 |
| 44915.854166666664 | 30.86 |
| 44915.864583333336 | 30.96 |
| 44915.875 | 31.05 |
| 44915.885416666664 | 31.09 |
| 44915.895833333336 | 31.13 |
| 44915.90625 | 31.18 |
| 44915.916666666664 | 31.22 |
| 44915.927083333336 | 31.26 |
| 44915.9375 | 31.27 |
| 44915.947916666664 | 31.3 |
| 44915.958333333336 | 31.32 |
| 44915.96875 | 31.21 |
| 44915.979166666664 | 31.24 |
| 44915.989583333336 | 31.23 |
| 44916.0 | 31.18 |
| 44916.010416666664 | 31.24 |
| 44916.020833333336 | 31.15 |
| 44916.03125 | 31.17 |
| 44916.041666666664 | 31.11 |
| 44916.052083333336 | 31.07 |
| 44916.0625 | 30.97 |
| 44916.072916666664 | 30.84 |
| 44916.083333333336 | 30.77 |
| 44916.09375 | 30.64 |
| 44916.104166666664 | 30.49 |
| 44916.114583333336 | 30.31 |
| 44916.125 | 30.13 |
| 44916.135416666664 | 29.96 |
| 44916.145833333336 | 29.79 |
| 44916.15625 | 29.53 |
| 44916.166666666664 | 29.42 |
| 44916.177083333336 | 29.3 |
| 44916.1875 | 29.27 |
| 44916.197916666664 | 29.24 |
| 44916.208333333336 | 29.25 |
| 44916.21875 | 29.39 |
| 44916.229166666664 | 29.44 |
| 44916.239583333336 | 29.48 |
| 44916.25 | 29.63 |
| 44916.260416666664 | 29.82 |
| 44916.270833333336 | 30.1 |
| 44916.28125 | 30.41 |
| 44916.291666666664 | 30.66 |
| 44916.302083333336 | 30.82 |
| 44916.3125 | 30.92 |
| 44916.322916666664 | 30.98 |
| 44916.333333333336 | 31.03 |
| 44916.34375 | 31.1 |
| 44916.354166666664 | 31.16 |
| 44916.364583333336 | 31.18 |
| 44916.375 | 31.24 |
| 44916.385416666664 | 31.3 |
| 44916.395833333336 | 31.38 |
| 44916.40625 | 31.42 |
| 44916.416666666664 | 31.44 |
| 44916.427083333336 | 31.45 |
| 44916.4375 | 31.46 |
| 44916.447916666664 | 31.45 |
| 44916.458333333336 | 31.45 |
| 44916.46875 | 31.45 |
| 44916.479166666664 | 31.45 |
| 44916.489583333336 | 31.46 |
| 44916.5 | 31.45 |
| 44916.510416666664 | 31.41 |
| 44916.520833333336 | 31.43 |
| 44916.53125 | 31.38 |
| 44916.541666666664 | 31.38 |
| 44916.552083333336 | 31.37 |
| 44916.5625 | 31.34 |
| 44916.572916666664 | 31.35 |
| 44916.583333333336 | 31.32 |
| 44916.59375 | 31.31 |
| 44916.604166666664 | 31.26 |
| 44916.614583333336 | 31.21 |
| 44916.625 | 31.17 |
| 44916.635416666664 | 31.14 |
| 44916.645833333336 | 31.12 |
| 44916.65625 | 31.09 |
| 44916.666666666664 | 30.97 |
| 44916.677083333336 | 30.81 |
| 44916.6875 | 30.66 |
| 44916.697916666664 | 30.54 |
| 44916.708333333336 | 30.5 |
| 44916.71875 | 30.28 |
| 44916.729166666664 | 30.18 |
| 44916.739583333336 | 30.11 |
| 44916.75 | 30.06 |
| 44916.760416666664 | 30.04 |
| 44916.770833333336 | 30.18 |
| 44916.78125 | 30.21 |
| 44916.791666666664 | 30.21 |
| 44916.802083333336 | 30.27 |
| 44916.8125 | 30.36 |
| 44916.822916666664 | 30.43 |
| 44916.833333333336 | 30.62 |
| 44916.84375 | 30.82 |
| 44916.854166666664 | 30.93 |
| 44916.864583333336 | 31 |
| 44916.875 | 31.03 |
| 44916.885416666664 | 31.15 |
| 44916.895833333336 | 31.21 |
| 44916.90625 | 31.27 |
| 44916.916666666664 | 31.29 |
| 44916.927083333336 | 31.32 |
| 44916.9375 | 31.33 |
| 44916.947916666664 | 31.36 |
| 44916.958333333336 | 31.38 |
| 44916.96875 | 31.41 |
| 44916.979166666664 | 31.42 |
| 44916.989583333336 | 31.43 |
| 44917.0 | 31.42 |
| 44917.010416666664 | 31.38 |
| 44917.020833333336 | 31.43 |
| 44917.03125 | 31.4 |
| 44917.041666666664 | 31.4 |
| 44917.052083333336 | 31.39 |
| 44917.0625 | 31.38 |
| 44917.072916666664 | 31.37 |
| 44917.083333333336 | 31.32 |
| 44917.09375 | 31.27 |
| 44917.104166666664 | 31.26 |
| 44917.114583333336 | 31.21 |
| 44917.125 | 31.12 |
| 44917.135416666664 | 31.09 |
| 44917.145833333336 | 31.05 |
| 44917.15625 | 30.95 |
| 44917.166666666664 | 30.8 |
| 44917.177083333336 | 30.69 |
| 44917.1875 | 30.5 |
| 44917.197916666664 | 30.41 |
| 44917.208333333336 | 30.36 |
| 44917.21875 | 30.3 |
| 44917.229166666664 | 30.21 |
| 44917.239583333336 | 30.18 |
| 44917.25 | 30.13 |
| 44917.260416666664 | 30.15 |
| 44917.270833333336 | 30.28 |
| 44917.28125 | 30.25 |
| 44917.291666666664 | 30.3 |
| 44917.302083333336 | 30.38 |
| 44917.3125 | 30.51 |
| 44917.322916666664 | 30.76 |
| 44917.333333333336 | 30.97 |
| 44917.34375 | 31.07 |
| 44917.354166666664 | 31.18 |
| 44917.364583333336 | 31.21 |
| 44917.375 | 31.27 |
| 44917.385416666664 | 31.3 |
| 44917.395833333336 | 31.34 |
| 44917.40625 | 31.36 |
| 44917.416666666664 | 31.4 |
| 44917.427083333336 | 31.44 |
| 44917.4375 | 31.49 |
| 44917.447916666664 | 31.52 |
| 44917.458333333336 | 31.54 |
| 44917.46875 | 31.54 |
| 44917.479166666664 | 31.54 |
| 44917.489583333336 | 31.54 |
| 44917.5 | 31.54 |
| 44917.510416666664 | 31.54 |
| 44917.520833333336 | 31.55 |
| 44917.53125 | 31.56 |
| 44917.541666666664 | 31.52 |
| 44917.552083333336 | 31.47 |
| 44917.5625 | 31.44 |
| 44917.572916666664 | 31.46 |
| 44917.583333333336 | 31.44 |
| 44917.59375 | 31.42 |
| 44917.604166666664 | 31.44 |
| 44917.614583333336 | 31.44 |
| 44917.625 | 31.43 |
| 44917.635416666664 | 31.38 |
| 44917.645833333336 | 31.36 |
| 44917.65625 | 31.36 |
| 44917.666666666664 | 31.3 |
| 44917.677083333336 | 31.27 |
| 44917.6875 | 31.22 |
| 44917.697916666664 | 31.19 |
| 44917.708333333336 | 31.16 |
| 44917.71875 | 31.12 |
| 44917.729166666664 | 31.09 |
| 44917.739583333336 | 31 |
| 44917.75 | 30.91 |
| 44917.760416666664 | 30.75 |
| 44917.770833333336 | 30.63 |
| 44917.78125 | 30.49 |
| 44917.791666666664 | 30.37 |
| 44917.802083333336 | 30.29 |
| 44917.8125 | 30.21 |
| 44917.822916666664 | 30.31 |
| 44917.833333333336 | 30.36 |
| 44917.84375 | 30.34 |
| 44917.854166666664 | 30.45 |
| 44917.864583333336 | 30.55 |
| 44917.875 | 30.73 |
| 44917.885416666664 | 30.82 |
| 44917.895833333336 | 30.93 |
| 44917.90625 | 30.97 |
| 44917.916666666664 | 30.99 |
| 44917.927083333336 | 31.01 |
| 44917.9375 | 31.05 |
| 44917.947916666664 | 31.05 |
| 44917.958333333336 | 31.08 |
| 44917.96875 | 31.09 |
| 44917.979166666664 | 31.13 |
| 44917.989583333336 | 31.17 |
| 44918.0 | 31.17 |
| 44918.010416666664 | 31.2 |
| 44918.020833333336 | 31.22 |
| 44918.03125 | 31.26 |
| 44918.041666666664 | 31.27 |
| 44918.052083333336 | 31.27 |
| 44918.0625 | 31.04 |
| 44918.072916666664 | 31.18 |
| 44918.083333333336 | 31.09 |
| 44918.09375 | 31.11 |
| 44918.104166666664 | 31.14 |
| 44918.114583333336 | 31.03 |
| 44918.125 | 31.04 |
| 44918.135416666664 | 30.96 |
| 44918.145833333336 | 30.86 |
| 44918.15625 | 30.82 |
| 44918.166666666664 | 30.77 |
| 44918.177083333336 | 30.66 |
| 44918.1875 | 30.64 |
| 44918.197916666664 | 30.5 |
| 44918.208333333336 | 30.49 |
| 44918.21875 | 30.39 |
| 44918.229166666664 | 30.52 |
| 44918.239583333336 | 30.39 |
| 44918.25 | 30.33 |
| 44918.260416666664 | 30.22 |
| 44918.270833333336 | 30.12 |
| 44918.28125 | 30.03 |
| 44918.291666666664 | 29.96 |
| 44918.302083333336 | 29.93 |
| 44918.3125 | 30.08 |
| 44918.322916666664 | 30 |
| 44918.333333333336 | 30.11 |
| 44918.34375 | 30.21 |
| 44918.354166666664 | 30.46 |
| 44918.364583333336 | 30.61 |
| 44918.375 | 30.61 |
| 44918.385416666664 | 30.64 |
| 44918.395833333336 | 30.7 |
| 44918.40625 | 30.76 |
| 44918.416666666664 | 30.82 |
| 44918.427083333336 | 30.91 |
| 44918.4375 | 30.99 |
| 44918.447916666664 | 31.08 |
| 44918.458333333336 | 31.14 |
| 44918.46875 | 31.16 |
| 44918.479166666664 | 31.2 |
| 44918.489583333336 | 31.21 |
| 44918.5 | 31.23 |
| 44918.510416666664 | 31.26 |
| 44918.520833333336 | 31.28 |
| 44918.53125 | 31.3 |
| 44918.541666666664 | 31.33 |
| 44918.552083333336 | 31.34 |
| 44918.5625 | 31.35 |
| 44918.572916666664 | 31.35 |
| 44918.583333333336 | 31.25 |
| 44918.59375 | 31.25 |
| 44918.604166666664 | 31.26 |
| 44918.614583333336 | 31.27 |
| 44918.625 | 31.28 |
| 44918.635416666664 | 31.26 |
| 44918.645833333336 | 31.22 |
| 44918.65625 | 31.18 |
| 44918.666666666664 | 31.18 |
| 44918.677083333336 | 31.1 |
| 44918.6875 | 31.04 |
| 44918.697916666664 | 30.97 |
| 44918.708333333336 | 30.95 |
| 44918.71875 | 30.75 |
| 44918.729166666664 | 30.84 |
| 44918.739583333336 | 30.81 |
| 44918.75 | 30.74 |
| 44918.760416666664 | 30.65 |
| 44918.770833333336 | 30.49 |
| 44918.78125 | 30.29 |
| 44918.791666666664 | 29.91 |
| 44918.802083333336 | 29.46 |
| 44918.8125 | 29.09 |
| 44918.822916666664 | 29 |
| 44918.833333333336 | 28.78 |
| 44918.84375 | 28.55 |
| 44918.854166666664 | 28.62 |
| 44918.864583333336 | 28.72 |
| 44918.875 | 28.67 |
| 44918.885416666664 | 28.72 |
| 44918.895833333336 | 28.94 |
| 44918.90625 | 29.41 |
| 44918.916666666664 | 29.67 |
| 44918.927083333336 | 29.81 |
| 44918.9375 | 30.06 |
| 44918.947916666664 | 30.24 |
| 44918.958333333336 | 30.45 |
| 44918.96875 | 30.6 |
| 44918.979166666664 | 30.71 |
| 44918.989583333336 | 30.82 |
| 44919.0 | 30.89 |
| 44919.010416666664 | 30.94 |
| 44919.020833333336 | 30.97 |
| 44919.03125 | 31.01 |
| 44919.041666666664 | 31.05 |
| 44919.052083333336 | 31.09 |
| 44919.0625 | 31.12 |
| 44919.072916666664 | 31.12 |
| 44919.083333333336 | 30.95 |
| 44919.09375 | 31.01 |
| 44919.104166666664 | 31.12 |
| 44919.114583333336 | 31.1 |
| 44919.125 | 31.09 |
| 44919.135416666664 | 31.06 |
| 44919.145833333336 | 31.01 |
| 44919.15625 | 30.98 |
| 44919.166666666664 | 30.74 |
| 44919.177083333336 | 30.49 |
| 44919.1875 | 30.24 |
| 44919.197916666664 | 29.91 |
| 44919.208333333336 | 29.48 |
| 44919.21875 | 29.16 |
| 44919.229166666664 | 29.01 |
| 44919.239583333336 | 28.83 |
| 44919.25 | 28.81 |
| 44919.260416666664 | 28.73 |
| 44919.270833333336 | 28.68 |
| 44919.28125 | 28.68 |
| 44919.291666666664 | 28.65 |
| 44919.302083333336 | 28.7 |
| 44919.3125 | 28.69 |
| 44919.322916666664 | 28.61 |
| 44919.333333333336 | 28.63 |
| 44919.34375 | 28.67 |
| 44919.354166666664 | 28.63 |
| 44919.364583333336 | 28.65 |
| 44919.375 | 28.7 |
| 44919.385416666664 | 28.94 |
| 44919.395833333336 | 29.48 |
| 44919.40625 | 30.09 |
| 44919.416666666664 | 30.48 |
| 44919.427083333336 | 30.67 |
| 44919.4375 | 30.8 |
| 44919.447916666664 | 30.84 |
| 44919.458333333336 | 31 |
| 44919.46875 | 31.08 |
| 44919.479166666664 | 31.16 |
| 44919.489583333336 | 31.23 |
| 44919.5 | 31.28 |
| 44919.510416666664 | 31.34 |
| 44919.520833333336 | 31.37 |
| 44919.53125 | 31.4 |
| 44919.541666666664 | 31.44 |
| 44919.552083333336 | 31.45 |
| 44919.5625 | 31.48 |
| 44919.572916666664 | 31.48 |
| 44919.583333333336 | 31.51 |
| 44919.59375 | 31.49 |
| 44919.604166666664 | 31.53 |
| 44919.614583333336 | 31.44 |
| 44919.625 | 31.47 |
| 44919.635416666664 | 31.5 |
| 44919.645833333336 | 31.4 |
| 44919.65625 | 31.4 |
| 44919.666666666664 | 31.52 |
| 44919.677083333336 | 31.35 |
| 44919.6875 | 31.33 |
| 44919.697916666664 | 31.34 |
| 44919.708333333336 | 31.32 |
| 44919.71875 | 31.27 |
| 44919.729166666664 | 31.17 |
| 44919.739583333336 | 30.92 |
| 44919.75 | 30.5 |
| 44919.760416666664 | 30.45 |
| 44919.770833333336 | 30.35 |
| 44919.78125 | 30.1 |
| 44919.791666666664 | 29.75 |
| 44919.802083333336 | 29.58 |
| 44919.8125 | 29.32 |
| 44919.822916666664 | 29.27 |
| 44919.833333333336 | 29.27 |
| 44919.84375 | 29.25 |
| 44919.854166666664 | 29.35 |
| 44919.864583333336 | 29.31 |
| 44919.875 | 29.27 |
| 44919.885416666664 | 29.32 |
| 44919.895833333336 | 29.3 |
| 44919.90625 | 29.28 |
| 44919.916666666664 | 29.28 |
| 44919.927083333336 | 29.47 |
| 44919.9375 | 29.83 |
| 44919.947916666664 | 30.11 |
| 44919.958333333336 | 30.49 |
| 44919.96875 | 30.72 |
| 44919.979166666664 | 30.79 |
| 44919.989583333336 | 30.87 |
| 44920.0 | 30.94 |
| 44920.010416666664 | 31.08 |
| 44920.020833333336 | 31.17 |
| 44920.03125 | 31.28 |
| 44920.041666666664 | 31.39 |
| 44920.052083333336 | 31.43 |
| 44920.0625 | 31.46 |
| 44920.072916666664 | 31.5 |
| 44920.083333333336 | 31.51 |
| 44920.09375 | 31.51 |
| 44920.104166666664 | 31.44 |
| 44920.114583333336 | 31.35 |
| 44920.125 | 31.52 |
| 44920.135416666664 | 31.43 |
| 44920.145833333336 | 31.42 |
| 44920.15625 | 31.43 |
| 44920.166666666664 | 31.49 |
| 44920.177083333336 | 31.43 |
| 44920.1875 | 31.33 |
| 44920.197916666664 | 30.88 |
| 44920.208333333336 | 30.69 |
| 44920.21875 | 30.56 |
| 44920.229166666664 | 30.42 |
| 44920.239583333336 | 30.2 |
| 44920.25 | 30.01 |
| 44920.260416666664 | 29.95 |
| 44920.270833333336 | 29.82 |
| 44920.28125 | 29.72 |
| 44920.291666666664 | 29.67 |
| 44920.302083333336 | 29.69 |
| 44920.3125 | 29.71 |
| 44920.322916666664 | 29.64 |
| 44920.333333333336 | 29.59 |
| 44920.34375 | 29.56 |
| 44920.354166666664 | 29.47 |
| 44920.364583333336 | 29.5 |
| 44920.375 | 29.6 |
| 44920.385416666664 | 29.6 |
| 44920.395833333336 | 29.6 |
| 44920.40625 | 29.64 |
| 44920.416666666664 | 29.69 |
| 44920.427083333336 | 29.96 |
| 44920.4375 | 30.12 |
| 44920.447916666664 | 30.41 |
| 44920.458333333336 | 30.71 |
| 44920.46875 | 30.84 |
| 44920.479166666664 | 30.89 |
| 44920.489583333336 | 31.01 |
| 44920.5 | 31.24 |
| 44920.510416666664 | 31.45 |
| 44920.520833333336 | 31.49 |
| 44920.53125 | 31.55 |
| 44920.541666666664 | 31.59 |
| 44920.552083333336 | 31.63 |
| 44920.5625 | 31.66 |
| 44920.572916666664 | 31.67 |
| 44920.583333333336 | 31.68 |
| 44920.59375 | 31.68 |
| 44920.604166666664 | 31.69 |
| 44920.614583333336 | 31.7 |
| 44920.625 | 31.7 |
| 44920.635416666664 | 31.68 |
| 44920.645833333336 | 31.6 |
| 44920.65625 | 31.64 |
| 44920.666666666664 | 31.64 |
| 44920.677083333336 | 31.63 |
| 44920.6875 | 31.61 |
| 44920.697916666664 | 31.59 |
| 44920.708333333336 | 31.56 |
| 44920.71875 | 31.52 |
| 44920.729166666664 | 31.26 |
| 44920.739583333336 | 31.44 |
| 44920.75 | 31.43 |
| 44920.760416666664 | 31.4 |
| 44920.770833333336 | 31.2 |
| 44920.78125 | 30.91 |
| 44920.791666666664 | 30.83 |
| 44920.802083333336 | 30.49 |
| 44920.8125 | 30.49 |
| 44920.822916666664 | 30.04 |
| 44920.833333333336 | 29.93 |
| 44920.84375 | 29.93 |
| 44920.854166666664 | 29.72 |
| 44920.864583333336 | 29.75 |
| 44920.875 | 29.78 |
| 44920.885416666664 | 29.82 |
| 44920.895833333336 | 29.79 |
| 44920.90625 | 29.8 |
| 44920.916666666664 | 29.83 |
| 44920.927083333336 | 29.8 |
| 44920.9375 | 29.79 |
| 44920.947916666664 | 29.78 |
| 44920.958333333336 | 29.93 |
| 44920.96875 | 30.18 |
| 44920.979166666664 | 30.3 |
| 44920.989583333336 | 30.52 |
| 44921.0 | 30.74 |
| 44921.010416666664 | 30.85 |
| 44921.020833333336 | 30.91 |
| 44921.03125 | 31.01 |
| 44921.041666666664 | 31.1 |
| 44921.052083333336 | 31.24 |
| 44921.0625 | 31.33 |
| 44921.072916666664 | 31.42 |
| 44921.083333333336 | 31.5 |
| 44921.09375 | 31.55 |
| 44921.104166666664 | 31.58 |
| 44921.114583333336 | 31.61 |
| 44921.125 | 31.63 |
| 44921.135416666664 | 31.61 |
| 44921.145833333336 | 31.63 |
| 44921.15625 | 31.54 |
| 44921.166666666664 | 31.59 |
| 44921.177083333336 | 31.56 |
| 44921.1875 | 31.52 |
| 44921.197916666664 | 31.53 |
| 44921.208333333336 | 31.55 |
| 44921.21875 | 31.54 |
| 44921.229166666664 | 31.48 |
| 44921.239583333336 | 31.4 |
| 44921.25 | 31.06 |
| 44921.260416666664 | 30.7 |
| 44921.270833333336 | 30.53 |
| 44921.28125 | 30.35 |
| 44921.291666666664 | 30.19 |
| 44921.302083333336 | 30.06 |
| 44921.3125 | 29.96 |
| 44921.322916666664 | 30 |
| 44921.333333333336 | 29.89 |
| 44921.34375 | 29.87 |
| 44921.354166666664 | 29.91 |
| 44921.364583333336 | 29.88 |
| 44921.375 | 29.9 |
| 44921.385416666664 | 29.89 |
| 44921.395833333336 | 29.9 |
| 44921.40625 | 29.92 |
| 44921.416666666664 | 29.88 |
| 44921.427083333336 | 29.86 |
| 44921.4375 | 29.88 |
| 44921.447916666664 | 29.9 |
| 44921.458333333336 | 30.1 |
| 44921.46875 | 30.26 |
| 44921.479166666664 | 30.49 |
| 44921.489583333336 | 30.71 |
| 44921.5 | 30.83 |
| 44921.510416666664 | 30.94 |
| 44921.520833333336 | 31.12 |
| 44921.53125 | 31.32 |
| 44921.541666666664 | 31.45 |
| 44921.552083333336 | 31.53 |
| 44921.5625 | 31.62 |
| 44921.572916666664 | 31.68 |
| 44921.583333333336 | 31.7 |
| 44921.59375 | 31.73 |
| 44921.604166666664 | 31.76 |
| 44921.614583333336 | 31.78 |
| 44921.625 | 31.79 |
| 44921.635416666664 | 31.79 |
| 44921.645833333336 | 31.8 |
| 44921.65625 | 31.8 |
| 44921.666666666664 | 31.8 |
| 44921.677083333336 | 31.71 |
| 44921.6875 | 31.71 |
| 44921.697916666664 | 31.73 |
| 44921.708333333336 | 31.75 |
| 44921.71875 | 31.68 |
| 44921.729166666664 | 31.68 |
| 44921.739583333336 | 31.65 |
| 44921.75 | 31.64 |
| 44921.760416666664 | 31.6 |
| 44921.770833333336 | 31.53 |
| 44921.78125 | 31.41 |
| 44921.791666666664 | 31.4 |
| 44921.802083333336 | 31.31 |
| 44921.8125 | 31.14 |
| 44921.822916666664 | 30.93 |
| 44921.833333333336 | 30.75 |
| 44921.84375 | 30.61 |
| 44921.854166666664 | 30.44 |
| 44921.864583333336 | 30.32 |
| 44921.875 | 30.16 |
| 44921.885416666664 | 30.1 |
| 44921.895833333336 | 30.06 |
| 44921.90625 | 30.09 |
| 44921.916666666664 | 30.13 |
| 44921.927083333336 | 30.17 |
| 44921.9375 | 30.16 |
| 44921.947916666664 | 30.14 |
| 44921.958333333336 | 30.1 |
| 44921.96875 | 30.06 |
| 44921.979166666664 | 30.09 |
| 44921.989583333336 | 30.26 |
| 44922.0 | 30.45 |
| 44922.010416666664 | 30.54 |
| 44922.020833333336 | 30.72 |
| 44922.03125 | 30.84 |
| 44922.041666666664 | 30.93 |
| 44922.052083333336 | 31.04 |
| 44922.0625 | 31.16 |
| 44922.072916666664 | 31.28 |
| 44922.083333333336 | 31.37 |
| 44922.09375 | 31.45 |
| 44922.104166666664 | 31.55 |
| 44922.114583333336 | 31.64 |
| 44922.125 | 31.66 |
| 44922.135416666664 | 31.7 |
| 44922.145833333336 | 31.73 |
| 44922.15625 | 31.77 |
| 44922.166666666664 | 31.77 |
| 44922.177083333336 | 31.78 |
| 44922.1875 | 31.68 |
| 44922.197916666664 | 31.72 |
| 44922.208333333336 | 31.72 |
| 44922.21875 | 31.68 |
| 44922.229166666664 | 31.72 |
| 44922.239583333336 | 31.7 |
| 44922.25 | 31.7 |
| 44922.260416666664 | 31.6 |
| 44922.270833333336 | 31.62 |
| 44922.28125 | 31.52 |
| 44922.291666666664 | 31.35 |
| 44922.302083333336 | 31.19 |
| 44922.3125 | 30.99 |
| 44922.322916666664 | 30.72 |
| 44922.333333333336 | 30.61 |
| 44922.34375 | 30.46 |
| 44922.354166666664 | 30.26 |
| 44922.364583333336 | 30.19 |
| 44922.375 | 30.24 |
| 44922.385416666664 | 29.98 |
| 44922.395833333336 | 30.05 |
| 44922.40625 | 30.04 |
| 44922.416666666664 | 30.04 |
| 44922.427083333336 | 30.06 |
| 44922.4375 | 30.05 |
| 44922.447916666664 | 30.07 |
| 44922.458333333336 | 30.04 |
| 44922.46875 | 30.03 |
| 44922.479166666664 | 30.03 |
| 44922.489583333336 | 30.12 |
| 44922.5 | 30.36 |
| 44922.510416666664 | 30.57 |
| 44922.520833333336 | 30.73 |
| 44922.53125 | 30.93 |
| 44922.541666666664 | 31.04 |
| 44922.552083333336 | 31.18 |
| 44922.5625 | 31.3 |
| 44922.572916666664 | 31.43 |
| 44922.583333333336 | 31.5 |
| 44922.59375 | 31.59 |
| 44922.604166666664 | 31.67 |
| 44922.614583333336 | 31.74 |
| 44922.625 | 31.79 |
| 44922.635416666664 | 31.82 |
| 44922.645833333336 | 31.83 |
| 44922.65625 | 31.84 |
| 44922.666666666664 | 31.84 |
| 44922.677083333336 | 31.85 |
| 44922.6875 | 31.85 |
| 44922.697916666664 | 31.86 |
| 44922.708333333336 | 31.84 |
| 44922.71875 | 31.73 |
| 44922.729166666664 | 31.67 |
| 44922.739583333336 | 31.76 |
| 44922.75 | 31.8 |
| 44922.760416666664 | 31.76 |
| 44922.770833333336 | 31.75 |
| 44922.78125 | 31.73 |
| 44922.791666666664 | 31.74 |
| 44922.802083333336 | 31.7 |
| 44922.8125 | 31.64 |
| 44922.822916666664 | 31.55 |
| 44922.833333333336 | 31.5 |
| 44922.84375 | 31.42 |
| 44922.854166666664 | 31.33 |
| 44922.864583333336 | 31.19 |
| 44922.875 | 31.03 |
| 44922.885416666664 | 30.9 |
| 44922.895833333336 | 30.71 |
| 44922.90625 | 30.57 |
| 44922.916666666664 | 30.48 |
| 44922.927083333336 | 30.41 |
| 44922.9375 | 30.26 |
| 44922.947916666664 | 30.18 |
| 44922.958333333336 | 30.16 |
| 44922.96875 | 30.18 |
| 44922.979166666664 | 30.26 |
| 44922.989583333336 | 30.22 |
| 44923.0 | 30.23 |
| 44923.010416666664 | 30.29 |
| 44923.020833333336 | 30.43 |
| 44923.03125 | 30.57 |
| 44923.041666666664 | 30.8 |
| 44923.052083333336 | 31 |
| 44923.0625 | 31.17 |
| 44923.072916666664 | 31.29 |
| 44923.083333333336 | 31.34 |
| 44923.09375 | 31.39 |
| 44923.104166666664 | 31.46 |
| 44923.114583333336 | 31.52 |
| 44923.125 | 31.59 |
| 44923.135416666664 | 31.61 |
| 44923.145833333336 | 31.69 |
| 44923.15625 | 31.74 |
| 44923.166666666664 | 31.77 |
| 44923.177083333336 | 31.8 |
| 44923.1875 | 31.83 |
| 44923.197916666664 | 31.85 |
| 44923.208333333336 | 31.86 |
| 44923.21875 | 31.87 |
| 44923.229166666664 | 31.77 |
| 44923.239583333336 | 31.78 |
| 44923.25 | 31.78 |
| 44923.260416666664 | 31.75 |
| 44923.270833333336 | 31.78 |
| 44923.28125 | 31.7 |
| 44923.291666666664 | 31.69 |
| 44923.302083333336 | 31.67 |
| 44923.3125 | 31.64 |
| 44923.322916666664 | 31.56 |
| 44923.333333333336 | 31.45 |
| 44923.34375 | 31.4 |
| 44923.354166666664 | 31.23 |
| 44923.364583333336 | 31.1 |
| 44923.375 | 30.96 |
| 44923.385416666664 | 30.8 |
| 44923.395833333336 | 30.61 |
| 44923.40625 | 30.48 |
| 44923.416666666664 | 30.36 |
| 44923.427083333336 | 30.32 |
| 44923.4375 | 30.17 |
| 44923.447916666664 | 30.13 |
| 44923.458333333336 | 30.19 |
| 44923.46875 | 30.17 |
| 44923.479166666664 | 30.19 |
| 44923.489583333336 | 30.26 |
| 44923.5 | 30.19 |
| 44923.510416666664 | 30.18 |
| 44923.520833333336 | 30.2 |
| 44923.53125 | 30.27 |
| 44923.541666666664 | 30.53 |
| 44923.552083333336 | 30.76 |
| 44923.5625 | 30.93 |
| 44923.572916666664 | 31.11 |
| 44923.583333333336 | 31.2 |
| 44923.59375 | 31.29 |
| 44923.604166666664 | 31.38 |
| 44923.614583333336 | 31.47 |
| 44923.625 | 31.56 |
| 44923.635416666664 | 31.62 |
| 44923.645833333336 | 31.69 |
| 44923.65625 | 31.75 |
| 44923.666666666664 | 31.79 |
| 44923.677083333336 | 31.85 |
| 44923.6875 | 31.87 |
| 44923.697916666664 | 31.87 |
| 44923.708333333336 | 31.88 |
| 44923.71875 | 31.88 |
| 44923.729166666664 | 31.89 |
| 44923.739583333336 | 31.87 |
| 44923.75 | 31.77 |
| 44923.760416666664 | 31.81 |
| 44923.770833333336 | 31.82 |
| 44923.78125 | 31.8 |
| 44923.791666666664 | 31.83 |
| 44923.802083333336 | 31.83 |
| 44923.8125 | 31.82 |
| 44923.822916666664 | 31.82 |
| 44923.833333333336 | 31.79 |
| 44923.84375 | 31.71 |
| 44923.854166666664 | 31.65 |
| 44923.864583333336 | 31.55 |
| 44923.875 | 31.45 |
| 44923.885416666664 | 31.27 |
| 44923.895833333336 | 31.02 |
| 44923.90625 | 30.83 |
| 44923.916666666664 | 30.63 |
| 44923.927083333336 | 30.51 |
| 44923.9375 | 30.38 |
| 44923.947916666664 | 30.28 |
| 44923.958333333336 | 30.17 |
| 44923.96875 | 30.09 |
| 44923.979166666664 | 30.07 |
| 44923.989583333336 | 30.08 |
| 44924.0 | 30.08 |
| 44924.010416666664 | 30.09 |
| 44924.020833333336 | 30.14 |
| 44924.03125 | 30.11 |
| 44924.041666666664 | 30.13 |
| 44924.052083333336 | 30.21 |
| 44924.0625 | 30.35 |
| 44924.072916666664 | 30.59 |
| 44924.083333333336 | 30.85 |
| 44924.09375 | 31.1 |
| 44924.104166666664 | 31.2 |
| 44924.114583333336 | 31.28 |
| 44924.125 | 31.34 |
| 44924.135416666664 | 31.42 |
| 44924.145833333336 | 31.5 |
| 44924.15625 | 31.58 |
| 44924.166666666664 | 31.63 |
| 44924.177083333336 | 31.72 |
| 44924.1875 | 31.75 |
| 44924.197916666664 | 31.81 |
| 44924.208333333336 | 31.83 |
| 44924.21875 | 31.86 |
| 44924.229166666664 | 31.89 |
| 44924.239583333336 | 31.9 |
| 44924.25 | 31.9 |
| 44924.260416666664 | 31.88 |
| 44924.270833333336 | 31.78 |
| 44924.28125 | 31.84 |
| 44924.291666666664 | 31.79 |
| 44924.302083333336 | 31.77 |
| 44924.3125 | 31.77 |
| 44924.322916666664 | 31.73 |
| 44924.333333333336 | 31.75 |
| 44924.34375 | 31.72 |
| 44924.354166666664 | 31.75 |
| 44924.364583333336 | 31.7 |
| 44924.375 | 31.53 |
| 44924.385416666664 | 31.4 |
| 44924.395833333336 | 31.29 |
| 44924.40625 | 31.14 |
| 44924.416666666664 | 30.98 |
| 44924.427083333336 | 30.8 |
| 44924.4375 | 30.66 |
| 44924.447916666664 | 30.5 |
| 44924.458333333336 | 30.35 |
| 44924.46875 | 30.21 |
| 44924.479166666664 | 30.14 |
| 44924.489583333336 | 30.11 |
| 44924.5 | 30.13 |
| 44924.510416666664 | 30.15 |
| 44924.520833333336 | 30.14 |
| 44924.53125 | 30.17 |
| 44924.541666666664 | 30.17 |
| 44924.552083333336 | 30.14 |
| 44924.5625 | 30.17 |
| 44924.572916666664 | 30.28 |
| 44924.583333333336 | 30.5 |
| 44924.59375 | 30.78 |
| 44924.604166666664 | 30.94 |
| 44924.614583333336 | 31.07 |
| 44924.625 | 31.19 |
| 44924.635416666664 | 31.25 |
| 44924.645833333336 | 31.34 |
| 44924.65625 | 31.42 |
| 44924.666666666664 | 31.5 |
| 44924.677083333336 | 31.57 |
| 44924.6875 | 31.63 |
| 44924.697916666664 | 31.71 |
| 44924.708333333336 | 31.76 |
| 44924.71875 | 31.82 |
| 44924.729166666664 | 31.82 |
| 44924.739583333336 | 31.86 |
| 44924.75 | 31.91 |
| 44924.760416666664 | 31.89 |
| 44924.770833333336 | 31.93 |
| 44924.78125 | 31.71 |
| 44924.791666666664 | 31.79 |
| 44924.802083333336 | 31.76 |
| 44924.8125 | 31.76 |
| 44924.822916666664 | 31.79 |
| 44924.833333333336 | 31.82 |
| 44924.84375 | 31.85 |
| 44924.854166666664 | 31.84 |
| 44924.864583333336 | 31.82 |
| 44924.875 | 31.8 |
| 44924.885416666664 | 31.7 |
| 44924.895833333336 | 31.58 |
| 44924.90625 | 31.34 |
| 44924.916666666664 | 31.1 |
| 44924.927083333336 | 30.95 |
| 44924.9375 | 30.8 |
| 44924.947916666664 | 30.71 |
| 44924.958333333336 | 30.58 |
| 44924.96875 | 30.47 |
| 44924.979166666664 | 30.34 |
| 44924.989583333336 | 30.25 |
| 44925.0 | 30.18 |
| 44925.010416666664 | 30.21 |
| 44925.020833333336 | 30.22 |
| 44925.03125 | 30.24 |
| 44925.041666666664 | 30.23 |
| 44925.052083333336 | 30.24 |
| 44925.0625 | 30.25 |
| 44925.072916666664 | 30.22 |
| 44925.083333333336 | 30.22 |
| 44925.09375 | 30.26 |
| 44925.104166666664 | 30.38 |
| 44925.114583333336 | 30.64 |
| 44925.125 | 30.88 |
| 44925.135416666664 | 31 |
| 44925.145833333336 | 31.08 |
| 44925.15625 | 31.21 |
| 44925.166666666664 | 31.34 |
| 44925.177083333336 | 31.47 |
| 44925.1875 | 31.56 |
| 44925.197916666664 | 31.65 |
| 44925.208333333336 | 31.71 |
| 44925.21875 | 31.76 |
| 44925.229166666664 | 31.81 |
| 44925.239583333336 | 31.84 |
| 44925.25 | 31.87 |
| 44925.260416666664 | 31.89 |
| 44925.270833333336 | 31.9 |
| 44925.28125 | 31.91 |
| 44925.291666666664 | 31.92 |
| 44925.302083333336 | 31.92 |
| 44925.3125 | 31.8 |
| 44925.322916666664 | 31.86 |
| 44925.333333333336 | 31.85 |
| 44925.34375 | 31.82 |
| 44925.354166666664 | 31.79 |
| 44925.364583333336 | 31.81 |
| 44925.375 | 31.76 |
| 44925.385416666664 | 31.78 |
| 44925.395833333336 | 31.74 |
| 44925.40625 | 31.7 |
| 44925.416666666664 | 31.6 |
| 44925.427083333336 | 31.49 |
| 44925.4375 | 31.36 |
| 44925.447916666664 | 31.19 |
| 44925.458333333336 | 31.01 |
| 44925.46875 | 30.84 |
| 44925.479166666664 | 30.73 |
| 44925.489583333336 | 30.54 |
| 44925.5 | 30.43 |
| 44925.510416666664 | 30.32 |
| 44925.520833333336 | 30.23 |
| 44925.53125 | 30.14 |
| 44925.541666666664 | 30.18 |
| 44925.552083333336 | 30.14 |
| 44925.5625 | 30.12 |
| 44925.572916666664 | 30.24 |
| 44925.583333333336 | 30.15 |
| 44925.59375 | 30.18 |
| 44925.604166666664 | 30.27 |
| 44925.614583333336 | 30.39 |
| 44925.625 | 30.68 |
| 44925.635416666664 | 30.94 |
| 44925.645833333336 | 31.15 |
| 44925.65625 | 31.25 |
| 44925.666666666664 | 31.36 |
| 44925.677083333336 | 31.39 |
| 44925.6875 | 31.46 |
| 44925.697916666664 | 31.53 |
| 44925.708333333336 | 31.59 |
| 44925.71875 | 31.62 |
| 44925.729166666664 | 31.67 |
| 44925.739583333336 | 31.71 |
| 44925.75 | 31.76 |
| 44925.760416666664 | 31.81 |
| 44925.770833333336 | 31.85 |
| 44925.78125 | 31.85 |
| 44925.791666666664 | 31.87 |
| 44925.802083333336 | 31.93 |
| 44925.8125 | 31.92 |
| 44925.822916666664 | 31.87 |
| 44925.833333333336 | 31.75 |
| 44925.84375 | 31.81 |
| 44925.854166666664 | 31.81 |
| 44925.864583333336 | 31.81 |
| 44925.875 | 31.86 |
| 44925.885416666664 | 31.84 |
| 44925.895833333336 | 31.85 |
| 44925.90625 | 31.8 |
| 44925.916666666664 | 31.8 |
| 44925.927083333336 | 31.74 |
| 44925.9375 | 31.72 |
| 44925.947916666664 | 31.62 |
| 44925.958333333336 | 31.46 |
| 44925.96875 | 31.19 |
| 44925.979166666664 | 31.01 |
| 44925.989583333336 | 30.83 |
| 44926.0 | 30.8 |
| 44926.010416666664 | 30.63 |
| 44926.020833333336 | 30.53 |
| 44926.03125 | 30.46 |
| 44926.041666666664 | 30.34 |
| 44926.052083333336 | 30.27 |
| 44926.0625 | 30.3 |
| 44926.072916666664 | 30.2 |
| 44926.083333333336 | 30.27 |
| 44926.09375 | 30.34 |
| 44926.104166666664 | 30.32 |
| 44926.114583333336 | 30.44 |
| 44926.125 | 30.54 |
| 44926.135416666664 | 30.75 |
| 44926.145833333336 | 31.04 |
| 44926.15625 | 31.26 |
| 44926.166666666664 | 31.43 |
| 44926.177083333336 | 31.51 |
| 44926.1875 | 31.56 |
| 44926.197916666664 | 31.62 |
| 44926.208333333336 | 31.68 |
| 44926.21875 | 31.73 |
| 44926.229166666664 | 31.76 |
| 44926.239583333336 | 31.79 |
| 44926.25 | 31.82 |
| 44926.260416666664 | 31.86 |
| 44926.270833333336 | 31.89 |
| 44926.28125 | 31.92 |
| 44926.291666666664 | 31.93 |
| 44926.302083333336 | 31.94 |
| 44926.3125 | 31.95 |
| 44926.322916666664 | 31.95 |
| 44926.333333333336 | 31.95 |
| 44926.34375 | 31.95 |
| 44926.354166666664 | 31.87 |
| 44926.364583333336 | 31.88 |
| 44926.375 | 31.91 |
| 44926.385416666664 | 31.88 |
| 44926.395833333336 | 31.9 |
| 44926.40625 | 31.84 |
| 44926.416666666664 | 31.83 |
| 44926.427083333336 | 31.73 |
| 44926.4375 | 31.82 |
| 44926.447916666664 | 31.76 |
| 44926.458333333336 | 31.61 |
| 44926.46875 | 31.24 |
| 44926.479166666664 | 31.14 |
| 44926.489583333336 | 31.09 |
| 44926.5 | 31.07 |
| 44926.510416666664 | 31.06 |
| 44926.520833333336 | 30.95 |
| 44926.53125 | 30.78 |
| 44926.541666666664 | 30.61 |
| 44926.552083333336 | 30.34 |
| 44926.5625 | 30.16 |
| 44926.572916666664 | 29.9 |
| 44926.583333333336 | 29.64 |
| 44926.59375 | 29.76 |
| 44926.604166666664 | 29.85 |
| 44926.614583333336 | 29.88 |
| 44926.625 | 29.88 |
| 44926.635416666664 | 29.86 |
| 44926.645833333336 | 29.88 |
| 44926.65625 | 29.83 |
| 44926.666666666664 | 30.03 |
| 44926.677083333336 | 30.02 |
| 44926.6875 | 30.38 |
| 44926.697916666664 | 30.59 |
| 44926.708333333336 | 30.71 |
| 44926.71875 | 30.79 |
| 44926.729166666664 | 30.73 |
| 44926.739583333336 | 30.59 |
| 44926.75 | 30.39 |
| 44926.760416666664 | 30.01 |
| 44926.770833333336 | 29.96 |
| 44926.78125 | 29.27 |
| 44926.791666666664 | 29.93 |
| 44926.802083333336 | 30.35 |
| 44926.8125 | 30.71 |
| 44926.822916666664 | 30.75 |
| 44926.833333333336 | 30.82 |
| 44926.84375 | 30.9 |
| 44926.854166666664 | 30.88 |
| 44926.864583333336 | 30.98 |
| 44926.875 | 30.72 |
| 44926.885416666664 | 30.8 |
| 44926.895833333336 | 31.02 |
| 44926.90625 | 30.76 |
| 44926.916666666664 | 30.69 |
| 44926.927083333336 | 30.68 |
| 44926.9375 | 30.68 |
| 44926.947916666664 | 30.56 |
| 44926.958333333336 | 30.42 |
| 44926.96875 | 30.06 |
| 44926.979166666664 | 30.21 |
| 44926.989583333336 | 30.34 |
| 44927.0 | 30.34 |
| 44927.010416666664 | 30.28 |
| 44927.020833333336 | 30.13 |
| 44927.03125 | 29.69 |
| 44927.041666666664 | 29.15 |
| 44927.052083333336 | 28.89 |
| 44927.0625 | 28.78 |
| 44927.072916666664 | 28.86 |
| 44927.083333333336 | 28.74 |
| 44927.09375 | 28.63 |
| 44927.104166666664 | 28.56 |
| 44927.114583333336 | 28.81 |
| 44927.125 | 28.89 |
| 44927.135416666664 | 29.06 |
| 44927.145833333336 | 28.87 |